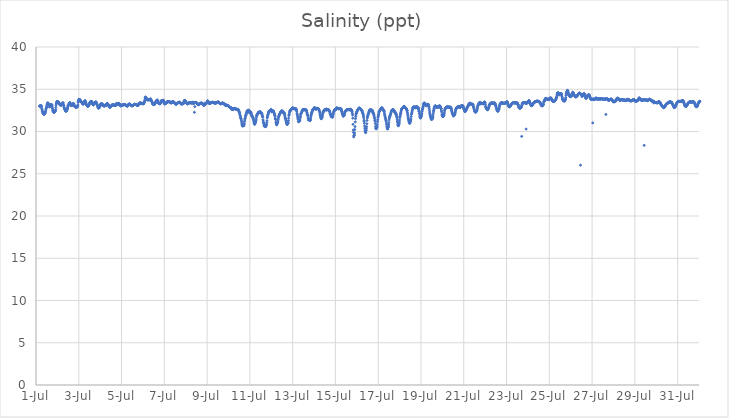
| Category | Salinity (ppt) |
|---|---|
| 44743.166666666664 | 32.98 |
| 44743.177083333336 | 33.02 |
| 44743.1875 | 33.01 |
| 44743.197916666664 | 33.05 |
| 44743.208333333336 | 33.06 |
| 44743.21875 | 33.03 |
| 44743.229166666664 | 33.04 |
| 44743.239583333336 | 33.05 |
| 44743.25 | 33.01 |
| 44743.260416666664 | 32.9 |
| 44743.270833333336 | 32.7 |
| 44743.28125 | 32.57 |
| 44743.291666666664 | 32.42 |
| 44743.302083333336 | 32.37 |
| 44743.3125 | 32.3 |
| 44743.322916666664 | 32.2 |
| 44743.333333333336 | 32.14 |
| 44743.34375 | 32.09 |
| 44743.354166666664 | 32.05 |
| 44743.364583333336 | 32.03 |
| 44743.375 | 32.03 |
| 44743.385416666664 | 32.08 |
| 44743.395833333336 | 32.12 |
| 44743.40625 | 32.13 |
| 44743.416666666664 | 32.15 |
| 44743.427083333336 | 32.22 |
| 44743.4375 | 32.3 |
| 44743.447916666664 | 32.38 |
| 44743.458333333336 | 32.54 |
| 44743.46875 | 32.67 |
| 44743.479166666664 | 32.76 |
| 44743.489583333336 | 32.83 |
| 44743.5 | 32.97 |
| 44743.510416666664 | 33.09 |
| 44743.520833333336 | 33.22 |
| 44743.53125 | 33.31 |
| 44743.541666666664 | 33.38 |
| 44743.552083333336 | 33.36 |
| 44743.5625 | 33.36 |
| 44743.572916666664 | 33.34 |
| 44743.583333333336 | 33.25 |
| 44743.59375 | 33.16 |
| 44743.604166666664 | 33.12 |
| 44743.614583333336 | 33.02 |
| 44743.625 | 32.96 |
| 44743.635416666664 | 32.93 |
| 44743.645833333336 | 32.91 |
| 44743.65625 | 33.01 |
| 44743.666666666664 | 33.02 |
| 44743.677083333336 | 33.11 |
| 44743.6875 | 33.08 |
| 44743.697916666664 | 33.15 |
| 44743.708333333336 | 33.2 |
| 44743.71875 | 33.18 |
| 44743.729166666664 | 33.14 |
| 44743.739583333336 | 33.16 |
| 44743.75 | 33.08 |
| 44743.760416666664 | 32.89 |
| 44743.770833333336 | 32.71 |
| 44743.78125 | 32.54 |
| 44743.791666666664 | 32.46 |
| 44743.802083333336 | 32.39 |
| 44743.8125 | 32.31 |
| 44743.822916666664 | 32.3 |
| 44743.833333333336 | 32.29 |
| 44743.84375 | 32.28 |
| 44743.854166666664 | 32.28 |
| 44743.864583333336 | 32.32 |
| 44743.875 | 32.35 |
| 44743.885416666664 | 32.37 |
| 44743.895833333336 | 32.38 |
| 44743.90625 | 32.45 |
| 44743.916666666664 | 32.59 |
| 44743.927083333336 | 32.84 |
| 44743.9375 | 33.12 |
| 44743.947916666664 | 33.27 |
| 44743.958333333336 | 33.34 |
| 44743.96875 | 33.45 |
| 44743.979166666664 | 33.54 |
| 44743.989583333336 | 33.55 |
| 44744.0 | 33.55 |
| 44744.010416666664 | 33.55 |
| 44744.020833333336 | 33.51 |
| 44744.03125 | 33.46 |
| 44744.041666666664 | 33.44 |
| 44744.052083333336 | 33.47 |
| 44744.0625 | 33.44 |
| 44744.072916666664 | 33.34 |
| 44744.083333333336 | 33.35 |
| 44744.09375 | 33.27 |
| 44744.104166666664 | 33.24 |
| 44744.114583333336 | 33.19 |
| 44744.125 | 33.19 |
| 44744.135416666664 | 33.12 |
| 44744.145833333336 | 33.11 |
| 44744.15625 | 33.19 |
| 44744.166666666664 | 33.16 |
| 44744.177083333336 | 33.1 |
| 44744.1875 | 33.14 |
| 44744.197916666664 | 33.18 |
| 44744.208333333336 | 33.28 |
| 44744.21875 | 33.27 |
| 44744.229166666664 | 33.32 |
| 44744.239583333336 | 33.33 |
| 44744.25 | 33.39 |
| 44744.260416666664 | 33.39 |
| 44744.270833333336 | 33.38 |
| 44744.28125 | 33.2 |
| 44744.291666666664 | 33.07 |
| 44744.302083333336 | 33.03 |
| 44744.3125 | 32.86 |
| 44744.322916666664 | 32.78 |
| 44744.333333333336 | 32.7 |
| 44744.34375 | 32.63 |
| 44744.354166666664 | 32.58 |
| 44744.364583333336 | 32.54 |
| 44744.375 | 32.47 |
| 44744.385416666664 | 32.44 |
| 44744.395833333336 | 32.41 |
| 44744.40625 | 32.4 |
| 44744.416666666664 | 32.41 |
| 44744.427083333336 | 32.49 |
| 44744.4375 | 32.52 |
| 44744.447916666664 | 32.54 |
| 44744.458333333336 | 32.61 |
| 44744.46875 | 32.7 |
| 44744.479166666664 | 32.84 |
| 44744.489583333336 | 32.95 |
| 44744.5 | 33.05 |
| 44744.510416666664 | 33.11 |
| 44744.520833333336 | 33.17 |
| 44744.53125 | 33.2 |
| 44744.541666666664 | 33.26 |
| 44744.552083333336 | 33.3 |
| 44744.5625 | 33.36 |
| 44744.572916666664 | 33.4 |
| 44744.583333333336 | 33.43 |
| 44744.59375 | 33.39 |
| 44744.604166666664 | 33.31 |
| 44744.614583333336 | 33.17 |
| 44744.625 | 33.14 |
| 44744.635416666664 | 33.12 |
| 44744.645833333336 | 33.1 |
| 44744.65625 | 33.06 |
| 44744.666666666664 | 33.12 |
| 44744.677083333336 | 33.12 |
| 44744.6875 | 33.11 |
| 44744.697916666664 | 33.12 |
| 44744.708333333336 | 33.19 |
| 44744.71875 | 33.2 |
| 44744.729166666664 | 33.26 |
| 44744.739583333336 | 33.32 |
| 44744.75 | 33.29 |
| 44744.760416666664 | 33.29 |
| 44744.770833333336 | 33.25 |
| 44744.78125 | 33.18 |
| 44744.791666666664 | 33.04 |
| 44744.802083333336 | 33.02 |
| 44744.8125 | 32.98 |
| 44744.822916666664 | 32.94 |
| 44744.833333333336 | 32.91 |
| 44744.84375 | 32.89 |
| 44744.854166666664 | 32.89 |
| 44744.864583333336 | 32.89 |
| 44744.875 | 32.88 |
| 44744.885416666664 | 32.89 |
| 44744.895833333336 | 32.89 |
| 44744.90625 | 32.89 |
| 44744.916666666664 | 32.89 |
| 44744.927083333336 | 32.93 |
| 44744.9375 | 32.95 |
| 44744.947916666664 | 32.99 |
| 44744.958333333336 | 33.14 |
| 44744.96875 | 33.45 |
| 44744.979166666664 | 33.55 |
| 44744.989583333336 | 33.65 |
| 44745.0 | 33.78 |
| 44745.010416666664 | 33.8 |
| 44745.020833333336 | 33.77 |
| 44745.03125 | 33.77 |
| 44745.041666666664 | 33.78 |
| 44745.052083333336 | 33.77 |
| 44745.0625 | 33.72 |
| 44745.072916666664 | 33.63 |
| 44745.083333333336 | 33.63 |
| 44745.09375 | 33.58 |
| 44745.104166666664 | 33.53 |
| 44745.114583333336 | 33.48 |
| 44745.125 | 33.46 |
| 44745.135416666664 | 33.43 |
| 44745.15625 | 33.43 |
| 44745.166666666664 | 33.36 |
| 44745.177083333336 | 33.32 |
| 44745.1875 | 33.24 |
| 44745.197916666664 | 33.25 |
| 44745.208333333336 | 33.24 |
| 44745.21875 | 33.29 |
| 44745.229166666664 | 33.33 |
| 44745.239583333336 | 33.4 |
| 44745.25 | 33.47 |
| 44745.260416666664 | 33.53 |
| 44745.270833333336 | 33.55 |
| 44745.28125 | 33.63 |
| 44745.291666666664 | 33.65 |
| 44745.302083333336 | 33.59 |
| 44745.3125 | 33.51 |
| 44745.322916666664 | 33.43 |
| 44745.333333333336 | 33.36 |
| 44745.34375 | 33.27 |
| 44745.354166666664 | 33.21 |
| 44745.364583333336 | 33.15 |
| 44745.375 | 33.1 |
| 44745.385416666664 | 33.09 |
| 44745.395833333336 | 33.03 |
| 44745.40625 | 33 |
| 44745.416666666664 | 32.97 |
| 44745.427083333336 | 32.97 |
| 44745.4375 | 33.03 |
| 44745.447916666664 | 33.06 |
| 44745.458333333336 | 33.06 |
| 44745.46875 | 33.09 |
| 44745.479166666664 | 33.13 |
| 44745.489583333336 | 33.19 |
| 44745.5 | 33.3 |
| 44745.510416666664 | 33.36 |
| 44745.520833333336 | 33.4 |
| 44745.53125 | 33.45 |
| 44745.541666666664 | 33.51 |
| 44745.552083333336 | 33.53 |
| 44745.5625 | 33.55 |
| 44745.572916666664 | 33.56 |
| 44745.583333333336 | 33.56 |
| 44745.59375 | 33.56 |
| 44745.604166666664 | 33.54 |
| 44745.614583333336 | 33.48 |
| 44745.625 | 33.42 |
| 44745.635416666664 | 33.35 |
| 44745.645833333336 | 33.28 |
| 44745.65625 | 33.21 |
| 44745.666666666664 | 33.19 |
| 44745.677083333336 | 33.16 |
| 44745.6875 | 33.15 |
| 44745.697916666664 | 33.2 |
| 44745.708333333336 | 33.24 |
| 44745.71875 | 33.39 |
| 44745.729166666664 | 33.38 |
| 44745.739583333336 | 33.37 |
| 44745.75 | 33.41 |
| 44745.760416666664 | 33.42 |
| 44745.770833333336 | 33.47 |
| 44745.78125 | 33.43 |
| 44745.791666666664 | 33.5 |
| 44745.802083333336 | 33.5 |
| 44745.8125 | 33.47 |
| 44745.822916666664 | 33.42 |
| 44745.833333333336 | 33.31 |
| 44745.84375 | 33.27 |
| 44745.854166666664 | 33.17 |
| 44745.864583333336 | 33.15 |
| 44745.875 | 33.08 |
| 44745.885416666664 | 32.94 |
| 44745.895833333336 | 32.85 |
| 44745.90625 | 32.78 |
| 44745.916666666664 | 32.79 |
| 44745.927083333336 | 32.77 |
| 44745.9375 | 32.78 |
| 44745.947916666664 | 32.8 |
| 44745.958333333336 | 32.86 |
| 44745.96875 | 32.88 |
| 44745.979166666664 | 32.9 |
| 44745.989583333336 | 32.97 |
| 44746.0 | 33.04 |
| 44746.010416666664 | 33.12 |
| 44746.020833333336 | 33.21 |
| 44746.03125 | 33.24 |
| 44746.041666666664 | 33.27 |
| 44746.052083333336 | 33.29 |
| 44746.0625 | 33.28 |
| 44746.072916666664 | 33.27 |
| 44746.083333333336 | 33.26 |
| 44746.09375 | 33.26 |
| 44746.104166666664 | 33.24 |
| 44746.114583333336 | 33.18 |
| 44746.125 | 33.15 |
| 44746.135416666664 | 33.1 |
| 44746.145833333336 | 33.08 |
| 44746.15625 | 33.06 |
| 44746.166666666664 | 33.04 |
| 44746.177083333336 | 33.03 |
| 44746.1875 | 33.01 |
| 44746.197916666664 | 33 |
| 44746.208333333336 | 33.1 |
| 44746.21875 | 33.04 |
| 44746.229166666664 | 33.05 |
| 44746.239583333336 | 33.11 |
| 44746.25 | 33.08 |
| 44746.260416666664 | 33.13 |
| 44746.270833333336 | 33.09 |
| 44746.28125 | 33.08 |
| 44746.291666666664 | 33.16 |
| 44746.302083333336 | 33.21 |
| 44746.3125 | 33.27 |
| 44746.322916666664 | 33.3 |
| 44746.333333333336 | 33.31 |
| 44746.34375 | 33.3 |
| 44746.354166666664 | 33.24 |
| 44746.364583333336 | 33.22 |
| 44746.375 | 33.16 |
| 44746.385416666664 | 33.12 |
| 44746.395833333336 | 33.07 |
| 44746.40625 | 33.02 |
| 44746.416666666664 | 32.96 |
| 44746.427083333336 | 32.92 |
| 44746.4375 | 32.87 |
| 44746.447916666664 | 32.87 |
| 44746.458333333336 | 32.87 |
| 44746.46875 | 32.9 |
| 44746.479166666664 | 32.93 |
| 44746.489583333336 | 32.94 |
| 44746.5 | 32.94 |
| 44746.510416666664 | 32.98 |
| 44746.520833333336 | 33.04 |
| 44746.53125 | 33.07 |
| 44746.541666666664 | 33.12 |
| 44746.552083333336 | 33.13 |
| 44746.5625 | 33.12 |
| 44746.572916666664 | 33.14 |
| 44746.583333333336 | 33.14 |
| 44746.59375 | 33.14 |
| 44746.604166666664 | 33.16 |
| 44746.614583333336 | 33.16 |
| 44746.625 | 33.16 |
| 44746.635416666664 | 33.15 |
| 44746.645833333336 | 33.13 |
| 44746.65625 | 33.13 |
| 44746.666666666664 | 33.1 |
| 44746.677083333336 | 33.1 |
| 44746.6875 | 33.09 |
| 44746.697916666664 | 33.05 |
| 44746.708333333336 | 33.1 |
| 44746.71875 | 33.12 |
| 44746.729166666664 | 33.15 |
| 44746.739583333336 | 33.18 |
| 44746.75 | 33.12 |
| 44746.760416666664 | 33.3 |
| 44746.770833333336 | 33.32 |
| 44746.78125 | 33.17 |
| 44746.791666666664 | 33.22 |
| 44746.802083333336 | 33.23 |
| 44746.8125 | 33.19 |
| 44746.822916666664 | 33.31 |
| 44746.833333333336 | 33.21 |
| 44746.84375 | 33.22 |
| 44746.854166666664 | 33.33 |
| 44746.864583333336 | 33.26 |
| 44746.875 | 33.27 |
| 44746.885416666664 | 33.28 |
| 44746.895833333336 | 33.29 |
| 44746.90625 | 33.23 |
| 44746.916666666664 | 33.22 |
| 44746.927083333336 | 33.16 |
| 44746.9375 | 33.09 |
| 44746.947916666664 | 33.04 |
| 44746.958333333336 | 33.05 |
| 44746.96875 | 33.03 |
| 44746.979166666664 | 33.08 |
| 44746.989583333336 | 33.07 |
| 44747.0 | 33.07 |
| 44747.010416666664 | 33.09 |
| 44747.020833333336 | 33.13 |
| 44747.03125 | 33.15 |
| 44747.041666666664 | 33.15 |
| 44747.052083333336 | 33.13 |
| 44747.0625 | 33.15 |
| 44747.072916666664 | 33.15 |
| 44747.083333333336 | 33.14 |
| 44747.09375 | 33.16 |
| 44747.104166666664 | 33.17 |
| 44747.114583333336 | 33.18 |
| 44747.125 | 33.2 |
| 44747.135416666664 | 33.21 |
| 44747.145833333336 | 33.2 |
| 44747.15625 | 33.18 |
| 44747.166666666664 | 33.15 |
| 44747.177083333336 | 33.16 |
| 44747.1875 | 33.14 |
| 44747.197916666664 | 33.09 |
| 44747.208333333336 | 33.1 |
| 44747.21875 | 33.08 |
| 44747.229166666664 | 33.07 |
| 44747.239583333336 | 33.02 |
| 44747.25 | 33.1 |
| 44747.260416666664 | 33.01 |
| 44747.270833333336 | 33.07 |
| 44747.28125 | 32.99 |
| 44747.291666666664 | 33.12 |
| 44747.302083333336 | 33.13 |
| 44747.3125 | 33.12 |
| 44747.322916666664 | 33.15 |
| 44747.333333333336 | 33.21 |
| 44747.34375 | 33.22 |
| 44747.354166666664 | 33.24 |
| 44747.364583333336 | 33.26 |
| 44747.375 | 33.26 |
| 44747.385416666664 | 33.25 |
| 44747.395833333336 | 33.22 |
| 44747.40625 | 33.19 |
| 44747.416666666664 | 33.16 |
| 44747.427083333336 | 33.13 |
| 44747.4375 | 33.11 |
| 44747.447916666664 | 33.09 |
| 44747.458333333336 | 33.07 |
| 44747.46875 | 33.05 |
| 44747.479166666664 | 33.04 |
| 44747.489583333336 | 33.04 |
| 44747.5 | 33.04 |
| 44747.510416666664 | 33.07 |
| 44747.520833333336 | 33.07 |
| 44747.53125 | 33.07 |
| 44747.541666666664 | 33.1 |
| 44747.552083333336 | 33.12 |
| 44747.5625 | 33.16 |
| 44747.572916666664 | 33.17 |
| 44747.583333333336 | 33.18 |
| 44747.59375 | 33.19 |
| 44747.604166666664 | 33.21 |
| 44747.614583333336 | 33.22 |
| 44747.625 | 33.22 |
| 44747.635416666664 | 33.21 |
| 44747.645833333336 | 33.2 |
| 44747.65625 | 33.2 |
| 44747.666666666664 | 33.2 |
| 44747.677083333336 | 33.18 |
| 44747.6875 | 33.17 |
| 44747.697916666664 | 33.16 |
| 44747.708333333336 | 33.15 |
| 44747.71875 | 33.12 |
| 44747.729166666664 | 33.1 |
| 44747.739583333336 | 33.09 |
| 44747.75 | 33.08 |
| 44747.760416666664 | 33.09 |
| 44747.770833333336 | 33.13 |
| 44747.78125 | 33.13 |
| 44747.791666666664 | 33.13 |
| 44747.802083333336 | 33.21 |
| 44747.8125 | 33.24 |
| 44747.822916666664 | 33.31 |
| 44747.833333333336 | 33.34 |
| 44747.84375 | 33.37 |
| 44747.854166666664 | 33.35 |
| 44747.864583333336 | 33.37 |
| 44747.875 | 33.34 |
| 44747.885416666664 | 33.39 |
| 44747.895833333336 | 33.38 |
| 44747.90625 | 33.36 |
| 44747.916666666664 | 33.34 |
| 44747.927083333336 | 33.32 |
| 44747.9375 | 33.32 |
| 44747.947916666664 | 33.29 |
| 44747.958333333336 | 33.3 |
| 44747.96875 | 33.3 |
| 44747.979166666664 | 33.3 |
| 44747.989583333336 | 33.29 |
| 44748.0 | 33.29 |
| 44748.010416666664 | 33.28 |
| 44748.020833333336 | 33.29 |
| 44748.03125 | 33.3 |
| 44748.041666666664 | 33.31 |
| 44748.052083333336 | 33.45 |
| 44748.0625 | 33.51 |
| 44748.072916666664 | 33.49 |
| 44748.083333333336 | 33.67 |
| 44748.09375 | 33.83 |
| 44748.104166666664 | 33.98 |
| 44748.114583333336 | 34.07 |
| 44748.125 | 34.06 |
| 44748.135416666664 | 34.05 |
| 44748.145833333336 | 34.02 |
| 44748.15625 | 33.94 |
| 44748.166666666664 | 33.9 |
| 44748.177083333336 | 33.81 |
| 44748.1875 | 33.75 |
| 44748.197916666664 | 33.74 |
| 44748.208333333336 | 33.76 |
| 44748.21875 | 33.76 |
| 44748.229166666664 | 33.76 |
| 44748.239583333336 | 33.78 |
| 44748.25 | 33.76 |
| 44748.260416666664 | 33.77 |
| 44748.270833333336 | 33.75 |
| 44748.28125 | 33.79 |
| 44748.291666666664 | 33.73 |
| 44748.302083333336 | 33.75 |
| 44748.3125 | 33.78 |
| 44748.322916666664 | 33.82 |
| 44748.333333333336 | 33.81 |
| 44748.34375 | 33.83 |
| 44748.354166666664 | 33.83 |
| 44748.364583333336 | 33.85 |
| 44748.375 | 33.8 |
| 44748.385416666664 | 33.7 |
| 44748.395833333336 | 33.66 |
| 44748.40625 | 33.6 |
| 44748.416666666664 | 33.53 |
| 44748.427083333336 | 33.47 |
| 44748.4375 | 33.37 |
| 44748.447916666664 | 33.32 |
| 44748.458333333336 | 33.28 |
| 44748.46875 | 33.24 |
| 44748.479166666664 | 33.22 |
| 44748.489583333336 | 33.21 |
| 44748.5 | 33.2 |
| 44748.510416666664 | 33.18 |
| 44748.520833333336 | 33.19 |
| 44748.53125 | 33.24 |
| 44748.541666666664 | 33.25 |
| 44748.552083333336 | 33.24 |
| 44748.5625 | 33.28 |
| 44748.572916666664 | 33.33 |
| 44748.583333333336 | 33.4 |
| 44748.59375 | 33.49 |
| 44748.604166666664 | 33.54 |
| 44748.614583333336 | 33.57 |
| 44748.625 | 33.62 |
| 44748.635416666664 | 33.65 |
| 44748.645833333336 | 33.67 |
| 44748.65625 | 33.71 |
| 44748.666666666664 | 33.73 |
| 44748.677083333336 | 33.69 |
| 44748.6875 | 33.63 |
| 44748.697916666664 | 33.56 |
| 44748.708333333336 | 33.47 |
| 44748.71875 | 33.41 |
| 44748.729166666664 | 33.36 |
| 44748.739583333336 | 33.35 |
| 44748.75 | 33.33 |
| 44748.760416666664 | 33.31 |
| 44748.770833333336 | 33.29 |
| 44748.78125 | 33.29 |
| 44748.791666666664 | 33.3 |
| 44748.802083333336 | 33.28 |
| 44748.8125 | 33.33 |
| 44748.822916666664 | 33.34 |
| 44748.833333333336 | 33.36 |
| 44748.84375 | 33.57 |
| 44748.854166666664 | 33.64 |
| 44748.864583333336 | 33.64 |
| 44748.875 | 33.66 |
| 44748.885416666664 | 33.58 |
| 44748.895833333336 | 33.63 |
| 44748.90625 | 33.63 |
| 44748.916666666664 | 33.64 |
| 44748.927083333336 | 33.68 |
| 44748.9375 | 33.68 |
| 44748.947916666664 | 33.68 |
| 44748.958333333336 | 33.7 |
| 44748.96875 | 33.55 |
| 44748.979166666664 | 33.5 |
| 44748.989583333336 | 33.43 |
| 44749.0 | 33.33 |
| 44749.010416666664 | 33.29 |
| 44749.020833333336 | 33.26 |
| 44749.03125 | 33.27 |
| 44749.041666666664 | 33.29 |
| 44749.052083333336 | 33.33 |
| 44749.0625 | 33.34 |
| 44749.072916666664 | 33.34 |
| 44749.083333333336 | 33.35 |
| 44749.09375 | 33.4 |
| 44749.104166666664 | 33.44 |
| 44749.114583333336 | 33.48 |
| 44749.125 | 33.49 |
| 44749.135416666664 | 33.49 |
| 44749.145833333336 | 33.52 |
| 44749.15625 | 33.53 |
| 44749.166666666664 | 33.54 |
| 44749.177083333336 | 33.53 |
| 44749.1875 | 33.54 |
| 44749.197916666664 | 33.53 |
| 44749.208333333336 | 33.53 |
| 44749.21875 | 33.53 |
| 44749.229166666664 | 33.51 |
| 44749.239583333336 | 33.51 |
| 44749.25 | 33.51 |
| 44749.260416666664 | 33.49 |
| 44749.270833333336 | 33.47 |
| 44749.28125 | 33.41 |
| 44749.291666666664 | 33.46 |
| 44749.302083333336 | 33.44 |
| 44749.3125 | 33.43 |
| 44749.322916666664 | 33.4 |
| 44749.333333333336 | 33.37 |
| 44749.34375 | 33.39 |
| 44749.354166666664 | 33.47 |
| 44749.364583333336 | 33.5 |
| 44749.375 | 33.53 |
| 44749.385416666664 | 33.5 |
| 44749.395833333336 | 33.52 |
| 44749.40625 | 33.53 |
| 44749.416666666664 | 33.52 |
| 44749.427083333336 | 33.52 |
| 44749.4375 | 33.5 |
| 44749.447916666664 | 33.49 |
| 44749.458333333336 | 33.44 |
| 44749.46875 | 33.41 |
| 44749.479166666664 | 33.36 |
| 44749.489583333336 | 33.35 |
| 44749.5 | 33.34 |
| 44749.510416666664 | 33.3 |
| 44749.520833333336 | 33.27 |
| 44749.53125 | 33.25 |
| 44749.541666666664 | 33.24 |
| 44749.552083333336 | 33.22 |
| 44749.5625 | 33.25 |
| 44749.572916666664 | 33.27 |
| 44749.583333333336 | 33.27 |
| 44749.59375 | 33.3 |
| 44749.604166666664 | 33.32 |
| 44749.614583333336 | 33.35 |
| 44749.625 | 33.39 |
| 44749.635416666664 | 33.41 |
| 44749.645833333336 | 33.42 |
| 44749.65625 | 33.43 |
| 44749.666666666664 | 33.43 |
| 44749.677083333336 | 33.44 |
| 44749.6875 | 33.45 |
| 44749.697916666664 | 33.46 |
| 44749.708333333336 | 33.46 |
| 44749.71875 | 33.46 |
| 44749.729166666664 | 33.44 |
| 44749.739583333336 | 33.42 |
| 44749.75 | 33.37 |
| 44749.760416666664 | 33.35 |
| 44749.770833333336 | 33.32 |
| 44749.78125 | 33.27 |
| 44749.791666666664 | 33.25 |
| 44749.802083333336 | 33.24 |
| 44749.8125 | 33.32 |
| 44749.822916666664 | 33.32 |
| 44749.833333333336 | 33.29 |
| 44749.84375 | 33.3 |
| 44749.854166666664 | 33.32 |
| 44749.864583333336 | 33.26 |
| 44749.875 | 33.28 |
| 44749.885416666664 | 33.39 |
| 44749.895833333336 | 33.31 |
| 44749.90625 | 33.45 |
| 44749.916666666664 | 33.44 |
| 44749.927083333336 | 33.65 |
| 44749.9375 | 33.52 |
| 44749.947916666664 | 33.66 |
| 44749.958333333336 | 33.67 |
| 44749.96875 | 33.64 |
| 44749.979166666664 | 33.65 |
| 44749.989583333336 | 33.6 |
| 44750.0 | 33.55 |
| 44750.010416666664 | 33.49 |
| 44750.020833333336 | 33.45 |
| 44750.03125 | 33.39 |
| 44750.041666666664 | 33.35 |
| 44750.052083333336 | 33.32 |
| 44750.0625 | 33.3 |
| 44750.072916666664 | 33.27 |
| 44750.083333333336 | 33.27 |
| 44750.09375 | 33.27 |
| 44750.104166666664 | 33.33 |
| 44750.114583333336 | 33.32 |
| 44750.125 | 33.32 |
| 44750.135416666664 | 33.35 |
| 44750.145833333336 | 33.39 |
| 44750.15625 | 33.42 |
| 44750.166666666664 | 33.41 |
| 44750.177083333336 | 33.41 |
| 44750.1875 | 33.39 |
| 44750.197916666664 | 33.4 |
| 44750.208333333336 | 33.41 |
| 44750.21875 | 33.4 |
| 44750.229166666664 | 33.41 |
| 44750.239583333336 | 33.41 |
| 44750.25 | 33.4 |
| 44750.260416666664 | 33.4 |
| 44750.270833333336 | 33.38 |
| 44750.28125 | 33.38 |
| 44750.291666666664 | 33.37 |
| 44750.302083333336 | 33.38 |
| 44750.3125 | 33.37 |
| 44750.322916666664 | 33.4 |
| 44750.333333333336 | 33.48 |
| 44750.34375 | 33.4 |
| 44750.354166666664 | 33.33 |
| 44750.364583333336 | 33.31 |
| 44750.375 | 33.35 |
| 44750.385416666664 | 33.38 |
| 44750.395833333336 | 33.36 |
| 44750.40625 | 32.27 |
| 44750.416666666664 | 33.43 |
| 44750.427083333336 | 32.95 |
| 44750.4375 | 33.43 |
| 44750.447916666664 | 33.43 |
| 44750.458333333336 | 33.45 |
| 44750.46875 | 33.44 |
| 44750.479166666664 | 33.44 |
| 44750.489583333336 | 33.44 |
| 44750.5 | 33.41 |
| 44750.510416666664 | 33.38 |
| 44750.520833333336 | 33.36 |
| 44750.53125 | 33.33 |
| 44750.541666666664 | 33.3 |
| 44750.552083333336 | 33.26 |
| 44750.5625 | 33.25 |
| 44750.572916666664 | 33.21 |
| 44750.583333333336 | 33.18 |
| 44750.59375 | 33.17 |
| 44750.604166666664 | 33.22 |
| 44750.614583333336 | 33.22 |
| 44750.625 | 33.21 |
| 44750.635416666664 | 33.24 |
| 44750.645833333336 | 33.28 |
| 44750.65625 | 33.3 |
| 44750.666666666664 | 33.31 |
| 44750.677083333336 | 33.33 |
| 44750.6875 | 33.33 |
| 44750.697916666664 | 33.34 |
| 44750.708333333336 | 33.34 |
| 44750.71875 | 33.36 |
| 44750.729166666664 | 33.36 |
| 44750.739583333336 | 33.36 |
| 44750.75 | 33.36 |
| 44750.760416666664 | 33.35 |
| 44750.770833333336 | 33.31 |
| 44750.78125 | 33.3 |
| 44750.791666666664 | 33.2 |
| 44750.802083333336 | 33.25 |
| 44750.8125 | 33.23 |
| 44750.822916666664 | 33.19 |
| 44750.833333333336 | 33.09 |
| 44750.84375 | 33.13 |
| 44750.854166666664 | 33.16 |
| 44750.864583333336 | 33.12 |
| 44750.875 | 33.13 |
| 44750.885416666664 | 33.34 |
| 44750.895833333336 | 33.2 |
| 44750.90625 | 33.22 |
| 44750.916666666664 | 33.23 |
| 44750.927083333336 | 33.25 |
| 44750.9375 | 33.32 |
| 44750.947916666664 | 33.32 |
| 44750.958333333336 | 33.3 |
| 44750.96875 | 33.33 |
| 44750.979166666664 | 33.35 |
| 44750.989583333336 | 33.44 |
| 44751.0 | 33.49 |
| 44751.010416666664 | 33.48 |
| 44751.020833333336 | 33.61 |
| 44751.03125 | 33.63 |
| 44751.041666666664 | 33.57 |
| 44751.052083333336 | 33.51 |
| 44751.0625 | 33.49 |
| 44751.072916666664 | 33.43 |
| 44751.083333333336 | 33.38 |
| 44751.09375 | 33.34 |
| 44751.104166666664 | 33.33 |
| 44751.114583333336 | 33.32 |
| 44751.125 | 33.32 |
| 44751.135416666664 | 33.34 |
| 44751.145833333336 | 33.34 |
| 44751.15625 | 33.35 |
| 44751.166666666664 | 33.39 |
| 44751.177083333336 | 33.39 |
| 44751.1875 | 33.43 |
| 44751.197916666664 | 33.41 |
| 44751.208333333336 | 33.42 |
| 44751.21875 | 33.43 |
| 44751.229166666664 | 33.44 |
| 44751.239583333336 | 33.46 |
| 44751.25 | 33.45 |
| 44751.260416666664 | 33.45 |
| 44751.270833333336 | 33.45 |
| 44751.28125 | 33.44 |
| 44751.291666666664 | 33.42 |
| 44751.302083333336 | 33.42 |
| 44751.3125 | 33.42 |
| 44751.322916666664 | 33.39 |
| 44751.333333333336 | 33.39 |
| 44751.34375 | 33.39 |
| 44751.354166666664 | 33.36 |
| 44751.364583333336 | 33.35 |
| 44751.375 | 33.35 |
| 44751.385416666664 | 33.38 |
| 44751.395833333336 | 33.38 |
| 44751.40625 | 33.39 |
| 44751.416666666664 | 33.39 |
| 44751.427083333336 | 33.41 |
| 44751.4375 | 33.39 |
| 44751.447916666664 | 33.41 |
| 44751.458333333336 | 33.42 |
| 44751.46875 | 33.44 |
| 44751.479166666664 | 33.47 |
| 44751.489583333336 | 33.49 |
| 44751.5 | 33.49 |
| 44751.510416666664 | 33.48 |
| 44751.520833333336 | 33.48 |
| 44751.53125 | 33.47 |
| 44751.541666666664 | 33.46 |
| 44751.552083333336 | 33.41 |
| 44751.5625 | 33.4 |
| 44751.572916666664 | 33.37 |
| 44751.583333333336 | 33.35 |
| 44751.59375 | 33.33 |
| 44751.604166666664 | 33.31 |
| 44751.614583333336 | 33.3 |
| 44751.625 | 33.28 |
| 44751.635416666664 | 33.28 |
| 44751.645833333336 | 33.3 |
| 44751.65625 | 33.29 |
| 44751.666666666664 | 33.3 |
| 44751.677083333336 | 33.31 |
| 44751.6875 | 33.33 |
| 44751.697916666664 | 33.36 |
| 44751.708333333336 | 33.38 |
| 44751.71875 | 33.37 |
| 44751.729166666664 | 33.36 |
| 44751.739583333336 | 33.36 |
| 44751.75 | 33.34 |
| 44751.760416666664 | 33.33 |
| 44751.770833333336 | 33.31 |
| 44751.78125 | 33.28 |
| 44751.791666666664 | 33.26 |
| 44751.802083333336 | 33.25 |
| 44751.8125 | 33.24 |
| 44751.822916666664 | 33.22 |
| 44751.833333333336 | 33.17 |
| 44751.84375 | 33.14 |
| 44751.854166666664 | 33.11 |
| 44751.864583333336 | 33.09 |
| 44751.875 | 33.06 |
| 44751.885416666664 | 33.09 |
| 44751.895833333336 | 33.08 |
| 44751.90625 | 33.15 |
| 44751.916666666664 | 33.12 |
| 44751.927083333336 | 33.1 |
| 44751.9375 | 33.09 |
| 44751.947916666664 | 33.09 |
| 44751.958333333336 | 33.07 |
| 44751.96875 | 33.04 |
| 44751.979166666664 | 33.06 |
| 44751.989583333336 | 33.04 |
| 44752.0 | 33.04 |
| 44752.010416666664 | 33 |
| 44752.020833333336 | 32.98 |
| 44752.03125 | 32.97 |
| 44752.041666666664 | 32.93 |
| 44752.052083333336 | 32.87 |
| 44752.0625 | 32.85 |
| 44752.072916666664 | 32.83 |
| 44752.083333333336 | 32.81 |
| 44752.09375 | 32.79 |
| 44752.104166666664 | 32.83 |
| 44752.114583333336 | 32.79 |
| 44752.125 | 32.8 |
| 44752.135416666664 | 32.77 |
| 44752.145833333336 | 32.69 |
| 44752.15625 | 32.61 |
| 44752.166666666664 | 32.6 |
| 44752.177083333336 | 32.62 |
| 44752.1875 | 32.66 |
| 44752.197916666664 | 32.71 |
| 44752.208333333336 | 32.68 |
| 44752.21875 | 32.65 |
| 44752.229166666664 | 32.64 |
| 44752.239583333336 | 32.65 |
| 44752.25 | 32.67 |
| 44752.260416666664 | 32.69 |
| 44752.270833333336 | 32.71 |
| 44752.28125 | 32.73 |
| 44752.291666666664 | 32.73 |
| 44752.302083333336 | 32.72 |
| 44752.3125 | 32.71 |
| 44752.322916666664 | 32.7 |
| 44752.333333333336 | 32.69 |
| 44752.34375 | 32.67 |
| 44752.354166666664 | 32.65 |
| 44752.364583333336 | 32.62 |
| 44752.375 | 32.61 |
| 44752.385416666664 | 32.61 |
| 44752.395833333336 | 32.61 |
| 44752.40625 | 32.62 |
| 44752.416666666664 | 32.62 |
| 44752.427083333336 | 32.6 |
| 44752.4375 | 32.61 |
| 44752.447916666664 | 32.61 |
| 44752.458333333336 | 32.5 |
| 44752.46875 | 32.53 |
| 44752.479166666664 | 32.45 |
| 44752.489583333336 | 32.41 |
| 44752.5 | 32.3 |
| 44752.510416666664 | 32.22 |
| 44752.520833333336 | 32.23 |
| 44752.53125 | 32.05 |
| 44752.541666666664 | 31.93 |
| 44752.552083333336 | 31.82 |
| 44752.5625 | 31.72 |
| 44752.572916666664 | 31.56 |
| 44752.583333333336 | 31.5 |
| 44752.59375 | 31.49 |
| 44752.604166666664 | 31.3 |
| 44752.614583333336 | 31.14 |
| 44752.625 | 30.98 |
| 44752.635416666664 | 30.82 |
| 44752.645833333336 | 30.69 |
| 44752.65625 | 30.66 |
| 44752.666666666664 | 30.68 |
| 44752.677083333336 | 30.69 |
| 44752.6875 | 30.73 |
| 44752.697916666664 | 30.71 |
| 44752.708333333336 | 30.67 |
| 44752.71875 | 30.7 |
| 44752.729166666664 | 30.84 |
| 44752.739583333336 | 30.97 |
| 44752.75 | 31.19 |
| 44752.760416666664 | 31.37 |
| 44752.770833333336 | 31.5 |
| 44752.78125 | 31.6 |
| 44752.791666666664 | 31.74 |
| 44752.802083333336 | 31.86 |
| 44752.8125 | 31.94 |
| 44752.822916666664 | 31.99 |
| 44752.833333333336 | 32.09 |
| 44752.84375 | 32.2 |
| 44752.854166666664 | 32.3 |
| 44752.864583333336 | 32.37 |
| 44752.875 | 32.43 |
| 44752.885416666664 | 32.46 |
| 44752.895833333336 | 32.49 |
| 44752.90625 | 32.49 |
| 44752.916666666664 | 32.5 |
| 44752.927083333336 | 32.51 |
| 44752.9375 | 32.52 |
| 44752.947916666664 | 32.47 |
| 44752.958333333336 | 32.38 |
| 44752.96875 | 32.47 |
| 44752.979166666664 | 32.21 |
| 44752.989583333336 | 32.28 |
| 44753.0 | 32.38 |
| 44753.010416666664 | 32.28 |
| 44753.020833333336 | 32.33 |
| 44753.03125 | 32.34 |
| 44753.041666666664 | 32.26 |
| 44753.052083333336 | 32.25 |
| 44753.0625 | 32.08 |
| 44753.072916666664 | 32.02 |
| 44753.083333333336 | 31.92 |
| 44753.09375 | 31.84 |
| 44753.104166666664 | 31.81 |
| 44753.114583333336 | 31.77 |
| 44753.125 | 31.77 |
| 44753.135416666664 | 31.66 |
| 44753.145833333336 | 31.61 |
| 44753.15625 | 31.51 |
| 44753.166666666664 | 31.43 |
| 44753.177083333336 | 31.28 |
| 44753.1875 | 31.14 |
| 44753.197916666664 | 31.01 |
| 44753.208333333336 | 30.92 |
| 44753.21875 | 30.86 |
| 44753.229166666664 | 30.85 |
| 44753.239583333336 | 30.96 |
| 44753.25 | 31.04 |
| 44753.260416666664 | 31.07 |
| 44753.270833333336 | 31.15 |
| 44753.28125 | 31.29 |
| 44753.291666666664 | 31.39 |
| 44753.302083333336 | 31.62 |
| 44753.3125 | 31.82 |
| 44753.322916666664 | 31.91 |
| 44753.333333333336 | 31.96 |
| 44753.34375 | 32.02 |
| 44753.354166666664 | 32.04 |
| 44753.364583333336 | 32.06 |
| 44753.375 | 32.1 |
| 44753.385416666664 | 32.2 |
| 44753.395833333336 | 32.23 |
| 44753.40625 | 32.25 |
| 44753.416666666664 | 32.27 |
| 44753.427083333336 | 32.31 |
| 44753.4375 | 32.33 |
| 44753.447916666664 | 32.34 |
| 44753.458333333336 | 32.27 |
| 44753.46875 | 32.27 |
| 44753.479166666664 | 32.28 |
| 44753.489583333336 | 32.34 |
| 44753.5 | 32.27 |
| 44753.510416666664 | 32.25 |
| 44753.520833333336 | 32.23 |
| 44753.53125 | 32.19 |
| 44753.541666666664 | 32.18 |
| 44753.552083333336 | 32.11 |
| 44753.5625 | 32.09 |
| 44753.572916666664 | 31.99 |
| 44753.583333333336 | 31.85 |
| 44753.59375 | 31.77 |
| 44753.604166666664 | 31.7 |
| 44753.614583333336 | 31.39 |
| 44753.625 | 31.22 |
| 44753.635416666664 | 31.07 |
| 44753.645833333336 | 30.94 |
| 44753.65625 | 30.91 |
| 44753.666666666664 | 30.72 |
| 44753.677083333336 | 30.67 |
| 44753.6875 | 30.62 |
| 44753.697916666664 | 30.57 |
| 44753.708333333336 | 30.66 |
| 44753.71875 | 30.63 |
| 44753.729166666664 | 30.65 |
| 44753.739583333336 | 30.67 |
| 44753.75 | 30.59 |
| 44753.760416666664 | 30.68 |
| 44753.770833333336 | 30.77 |
| 44753.78125 | 30.87 |
| 44753.791666666664 | 31.06 |
| 44753.802083333336 | 31.28 |
| 44753.8125 | 31.62 |
| 44753.822916666664 | 31.74 |
| 44753.833333333336 | 31.9 |
| 44753.84375 | 32.03 |
| 44753.854166666664 | 32.06 |
| 44753.864583333336 | 32.17 |
| 44753.875 | 32.26 |
| 44753.885416666664 | 32.36 |
| 44753.895833333336 | 32.4 |
| 44753.90625 | 32.41 |
| 44753.916666666664 | 32.43 |
| 44753.927083333336 | 32.44 |
| 44753.9375 | 32.46 |
| 44753.947916666664 | 32.49 |
| 44753.958333333336 | 32.53 |
| 44753.96875 | 32.55 |
| 44753.979166666664 | 32.57 |
| 44753.989583333336 | 32.59 |
| 44754.0 | 32.59 |
| 44754.010416666664 | 32.53 |
| 44754.020833333336 | 32.32 |
| 44754.03125 | 32.49 |
| 44754.041666666664 | 32.37 |
| 44754.052083333336 | 32.37 |
| 44754.0625 | 32.43 |
| 44754.072916666664 | 32.44 |
| 44754.083333333336 | 32.44 |
| 44754.09375 | 32.4 |
| 44754.104166666664 | 32.4 |
| 44754.114583333336 | 32.3 |
| 44754.125 | 32.23 |
| 44754.135416666664 | 32.17 |
| 44754.145833333336 | 32.08 |
| 44754.15625 | 32 |
| 44754.166666666664 | 31.9 |
| 44754.177083333336 | 31.77 |
| 44754.1875 | 31.55 |
| 44754.197916666664 | 31.45 |
| 44754.208333333336 | 31.41 |
| 44754.21875 | 31.12 |
| 44754.229166666664 | 30.99 |
| 44754.239583333336 | 30.86 |
| 44754.25 | 30.8 |
| 44754.260416666664 | 30.8 |
| 44754.270833333336 | 30.98 |
| 44754.28125 | 30.98 |
| 44754.291666666664 | 31.01 |
| 44754.302083333336 | 31.12 |
| 44754.3125 | 31.23 |
| 44754.322916666664 | 31.4 |
| 44754.333333333336 | 31.6 |
| 44754.34375 | 31.74 |
| 44754.354166666664 | 31.82 |
| 44754.364583333336 | 31.91 |
| 44754.375 | 31.98 |
| 44754.385416666664 | 32.03 |
| 44754.395833333336 | 32.07 |
| 44754.40625 | 32.12 |
| 44754.416666666664 | 32.17 |
| 44754.427083333336 | 32.24 |
| 44754.4375 | 32.3 |
| 44754.447916666664 | 32.34 |
| 44754.458333333336 | 32.37 |
| 44754.46875 | 32.4 |
| 44754.479166666664 | 32.42 |
| 44754.489583333336 | 32.44 |
| 44754.5 | 32.45 |
| 44754.510416666664 | 32.39 |
| 44754.520833333336 | 32.39 |
| 44754.53125 | 32.35 |
| 44754.541666666664 | 32.28 |
| 44754.552083333336 | 32.23 |
| 44754.5625 | 32.33 |
| 44754.572916666664 | 32.18 |
| 44754.583333333336 | 32.14 |
| 44754.59375 | 32.2 |
| 44754.604166666664 | 32.21 |
| 44754.614583333336 | 32.12 |
| 44754.625 | 32.01 |
| 44754.635416666664 | 31.84 |
| 44754.645833333336 | 31.7 |
| 44754.65625 | 31.58 |
| 44754.666666666664 | 31.52 |
| 44754.677083333336 | 31.48 |
| 44754.6875 | 31.32 |
| 44754.697916666664 | 31.2 |
| 44754.708333333336 | 31.08 |
| 44754.71875 | 30.98 |
| 44754.729166666664 | 30.9 |
| 44754.739583333336 | 30.85 |
| 44754.75 | 30.83 |
| 44754.760416666664 | 30.94 |
| 44754.770833333336 | 30.95 |
| 44754.78125 | 30.97 |
| 44754.791666666664 | 31.09 |
| 44754.802083333336 | 31.3 |
| 44754.8125 | 31.57 |
| 44754.822916666664 | 31.87 |
| 44754.833333333336 | 31.98 |
| 44754.84375 | 32.07 |
| 44754.854166666664 | 32.26 |
| 44754.864583333336 | 32.38 |
| 44754.875 | 32.44 |
| 44754.885416666664 | 32.44 |
| 44754.895833333336 | 32.48 |
| 44754.90625 | 32.52 |
| 44754.916666666664 | 32.59 |
| 44754.927083333336 | 32.6 |
| 44754.9375 | 32.62 |
| 44754.947916666664 | 32.67 |
| 44754.958333333336 | 32.67 |
| 44754.96875 | 32.71 |
| 44754.979166666664 | 32.76 |
| 44754.989583333336 | 32.79 |
| 44755.0 | 32.79 |
| 44755.010416666664 | 32.79 |
| 44755.020833333336 | 32.77 |
| 44755.03125 | 32.74 |
| 44755.041666666664 | 32.73 |
| 44755.052083333336 | 32.71 |
| 44755.0625 | 32.68 |
| 44755.072916666664 | 32.68 |
| 44755.083333333336 | 32.69 |
| 44755.09375 | 32.72 |
| 44755.104166666664 | 32.7 |
| 44755.114583333336 | 32.68 |
| 44755.125 | 32.72 |
| 44755.135416666664 | 32.71 |
| 44755.145833333336 | 32.71 |
| 44755.15625 | 32.67 |
| 44755.166666666664 | 32.61 |
| 44755.177083333336 | 32.55 |
| 44755.1875 | 32.44 |
| 44755.197916666664 | 32.32 |
| 44755.208333333336 | 32.11 |
| 44755.21875 | 31.99 |
| 44755.229166666664 | 31.84 |
| 44755.239583333336 | 31.65 |
| 44755.25 | 31.5 |
| 44755.260416666664 | 31.4 |
| 44755.270833333336 | 31.18 |
| 44755.28125 | 31.15 |
| 44755.291666666664 | 31.17 |
| 44755.302083333336 | 31.25 |
| 44755.3125 | 31.25 |
| 44755.322916666664 | 31.25 |
| 44755.333333333336 | 31.33 |
| 44755.34375 | 31.49 |
| 44755.354166666664 | 31.65 |
| 44755.364583333336 | 31.8 |
| 44755.375 | 31.98 |
| 44755.385416666664 | 32.09 |
| 44755.395833333336 | 32.15 |
| 44755.40625 | 32.2 |
| 44755.416666666664 | 32.24 |
| 44755.427083333336 | 32.31 |
| 44755.4375 | 32.38 |
| 44755.447916666664 | 32.44 |
| 44755.458333333336 | 32.47 |
| 44755.46875 | 32.54 |
| 44755.479166666664 | 32.58 |
| 44755.489583333336 | 32.59 |
| 44755.5 | 32.6 |
| 44755.510416666664 | 32.6 |
| 44755.520833333336 | 32.6 |
| 44755.53125 | 32.6 |
| 44755.541666666664 | 32.6 |
| 44755.552083333336 | 32.58 |
| 44755.5625 | 32.58 |
| 44755.572916666664 | 32.57 |
| 44755.583333333336 | 32.59 |
| 44755.59375 | 32.56 |
| 44755.604166666664 | 32.55 |
| 44755.614583333336 | 32.56 |
| 44755.625 | 32.54 |
| 44755.635416666664 | 32.53 |
| 44755.645833333336 | 32.5 |
| 44755.65625 | 32.41 |
| 44755.666666666664 | 32.23 |
| 44755.677083333336 | 32.16 |
| 44755.6875 | 32.02 |
| 44755.697916666664 | 31.94 |
| 44755.708333333336 | 31.89 |
| 44755.71875 | 31.72 |
| 44755.729166666664 | 31.52 |
| 44755.739583333336 | 31.35 |
| 44755.75 | 31.45 |
| 44755.760416666664 | 31.39 |
| 44755.770833333336 | 31.45 |
| 44755.78125 | 31.37 |
| 44755.791666666664 | 31.39 |
| 44755.802083333336 | 31.41 |
| 44755.8125 | 31.31 |
| 44755.822916666664 | 31.31 |
| 44755.833333333336 | 31.42 |
| 44755.84375 | 31.61 |
| 44755.854166666664 | 31.83 |
| 44755.864583333336 | 31.93 |
| 44755.875 | 32.06 |
| 44755.885416666664 | 32.17 |
| 44755.895833333336 | 32.25 |
| 44755.90625 | 32.32 |
| 44755.916666666664 | 32.41 |
| 44755.927083333336 | 32.52 |
| 44755.9375 | 32.59 |
| 44755.947916666664 | 32.62 |
| 44755.958333333336 | 32.62 |
| 44755.96875 | 32.61 |
| 44755.979166666664 | 32.61 |
| 44755.989583333336 | 32.65 |
| 44756.0 | 32.73 |
| 44756.010416666664 | 32.81 |
| 44756.020833333336 | 32.84 |
| 44756.03125 | 32.81 |
| 44756.041666666664 | 32.76 |
| 44756.052083333336 | 32.75 |
| 44756.0625 | 32.71 |
| 44756.072916666664 | 32.68 |
| 44756.083333333336 | 32.64 |
| 44756.09375 | 32.71 |
| 44756.104166666664 | 32.65 |
| 44756.114583333336 | 32.7 |
| 44756.125 | 32.75 |
| 44756.135416666664 | 32.74 |
| 44756.145833333336 | 32.74 |
| 44756.15625 | 32.72 |
| 44756.166666666664 | 32.72 |
| 44756.177083333336 | 32.72 |
| 44756.1875 | 32.71 |
| 44756.197916666664 | 32.68 |
| 44756.208333333336 | 32.65 |
| 44756.21875 | 32.65 |
| 44756.229166666664 | 32.6 |
| 44756.239583333336 | 32.51 |
| 44756.25 | 32.4 |
| 44756.260416666664 | 32.35 |
| 44756.270833333336 | 32.2 |
| 44756.28125 | 32.04 |
| 44756.291666666664 | 31.89 |
| 44756.302083333336 | 31.83 |
| 44756.3125 | 31.64 |
| 44756.322916666664 | 31.61 |
| 44756.333333333336 | 31.5 |
| 44756.34375 | 31.53 |
| 44756.354166666664 | 31.63 |
| 44756.364583333336 | 31.59 |
| 44756.375 | 31.66 |
| 44756.385416666664 | 31.76 |
| 44756.395833333336 | 31.95 |
| 44756.40625 | 32.11 |
| 44756.416666666664 | 32.23 |
| 44756.427083333336 | 32.3 |
| 44756.4375 | 32.34 |
| 44756.447916666664 | 32.38 |
| 44756.458333333336 | 32.44 |
| 44756.46875 | 32.48 |
| 44756.479166666664 | 32.51 |
| 44756.489583333336 | 32.57 |
| 44756.5 | 32.59 |
| 44756.510416666664 | 32.6 |
| 44756.520833333336 | 32.6 |
| 44756.53125 | 32.59 |
| 44756.541666666664 | 32.6 |
| 44756.552083333336 | 32.6 |
| 44756.5625 | 32.63 |
| 44756.572916666664 | 32.65 |
| 44756.583333333336 | 32.5 |
| 44756.59375 | 32.61 |
| 44756.604166666664 | 32.63 |
| 44756.614583333336 | 32.62 |
| 44756.625 | 32.6 |
| 44756.635416666664 | 32.6 |
| 44756.645833333336 | 32.62 |
| 44756.65625 | 32.56 |
| 44756.666666666664 | 32.59 |
| 44756.677083333336 | 32.58 |
| 44756.6875 | 32.56 |
| 44756.697916666664 | 32.53 |
| 44756.708333333336 | 32.46 |
| 44756.71875 | 32.42 |
| 44756.729166666664 | 32.39 |
| 44756.739583333336 | 32.3 |
| 44756.75 | 32.14 |
| 44756.760416666664 | 32.17 |
| 44756.770833333336 | 32.05 |
| 44756.78125 | 31.96 |
| 44756.791666666664 | 31.91 |
| 44756.802083333336 | 31.74 |
| 44756.8125 | 31.8 |
| 44756.822916666664 | 31.77 |
| 44756.833333333336 | 31.76 |
| 44756.84375 | 31.82 |
| 44756.854166666664 | 31.76 |
| 44756.864583333336 | 31.69 |
| 44756.875 | 31.73 |
| 44756.885416666664 | 31.84 |
| 44756.895833333336 | 32.03 |
| 44756.90625 | 32.16 |
| 44756.916666666664 | 32.3 |
| 44756.927083333336 | 32.38 |
| 44756.9375 | 32.42 |
| 44756.947916666664 | 32.47 |
| 44756.958333333336 | 32.55 |
| 44756.96875 | 32.59 |
| 44756.979166666664 | 32.63 |
| 44756.989583333336 | 32.63 |
| 44757.0 | 32.6 |
| 44757.010416666664 | 32.59 |
| 44757.020833333336 | 32.59 |
| 44757.03125 | 32.65 |
| 44757.041666666664 | 32.72 |
| 44757.052083333336 | 32.78 |
| 44757.0625 | 32.79 |
| 44757.072916666664 | 32.78 |
| 44757.083333333336 | 32.77 |
| 44757.09375 | 32.74 |
| 44757.104166666664 | 32.73 |
| 44757.114583333336 | 32.72 |
| 44757.125 | 32.73 |
| 44757.135416666664 | 32.69 |
| 44757.145833333336 | 32.69 |
| 44757.15625 | 32.72 |
| 44757.166666666664 | 32.73 |
| 44757.177083333336 | 32.72 |
| 44757.1875 | 32.71 |
| 44757.197916666664 | 32.71 |
| 44757.208333333336 | 32.71 |
| 44757.21875 | 32.7 |
| 44757.229166666664 | 32.69 |
| 44757.239583333336 | 32.69 |
| 44757.25 | 32.68 |
| 44757.260416666664 | 32.66 |
| 44757.270833333336 | 32.64 |
| 44757.28125 | 32.54 |
| 44757.291666666664 | 32.42 |
| 44757.302083333336 | 32.36 |
| 44757.3125 | 32.22 |
| 44757.322916666664 | 32.09 |
| 44757.333333333336 | 32.04 |
| 44757.34375 | 32.03 |
| 44757.354166666664 | 31.87 |
| 44757.364583333336 | 31.81 |
| 44757.375 | 31.82 |
| 44757.385416666664 | 31.9 |
| 44757.395833333336 | 31.91 |
| 44757.40625 | 31.92 |
| 44757.416666666664 | 32 |
| 44757.427083333336 | 32.1 |
| 44757.4375 | 32.21 |
| 44757.447916666664 | 32.32 |
| 44757.458333333336 | 32.39 |
| 44757.46875 | 32.42 |
| 44757.479166666664 | 32.43 |
| 44757.489583333336 | 32.44 |
| 44757.5 | 32.48 |
| 44757.510416666664 | 32.51 |
| 44757.520833333336 | 32.53 |
| 44757.53125 | 32.57 |
| 44757.541666666664 | 32.57 |
| 44757.552083333336 | 32.58 |
| 44757.5625 | 32.59 |
| 44757.572916666664 | 32.59 |
| 44757.583333333336 | 32.6 |
| 44757.59375 | 32.58 |
| 44757.604166666664 | 32.61 |
| 44757.614583333336 | 32.6 |
| 44757.625 | 32.57 |
| 44757.635416666664 | 32.59 |
| 44757.645833333336 | 32.59 |
| 44757.65625 | 32.58 |
| 44757.666666666664 | 32.58 |
| 44757.677083333336 | 32.59 |
| 44757.6875 | 32.65 |
| 44757.697916666664 | 32.57 |
| 44757.708333333336 | 32.56 |
| 44757.71875 | 32.57 |
| 44757.729166666664 | 32.57 |
| 44757.739583333336 | 32.58 |
| 44757.75 | 32.5 |
| 44757.760416666664 | 32.46 |
| 44757.770833333336 | 32.43 |
| 44757.78125 | 32.32 |
| 44757.791666666664 | 32.14 |
| 44757.802083333336 | 31.95 |
| 44757.8125 | 31.58 |
| 44757.822916666664 | 30.85 |
| 44757.833333333336 | 30.18 |
| 44757.84375 | 29.88 |
| 44757.854166666664 | 29.36 |
| 44757.864583333336 | 29.5 |
| 44757.875 | 29.53 |
| 44757.885416666664 | 29.58 |
| 44757.895833333336 | 29.83 |
| 44757.90625 | 30.23 |
| 44757.916666666664 | 30.58 |
| 44757.927083333336 | 31.13 |
| 44757.9375 | 31.52 |
| 44757.947916666664 | 31.77 |
| 44757.958333333336 | 31.96 |
| 44757.96875 | 32.1 |
| 44757.979166666664 | 32.17 |
| 44757.989583333336 | 32.24 |
| 44758.0 | 32.31 |
| 44758.010416666664 | 32.36 |
| 44758.020833333336 | 32.45 |
| 44758.03125 | 32.5 |
| 44758.041666666664 | 32.55 |
| 44758.052083333336 | 32.56 |
| 44758.0625 | 32.6 |
| 44758.072916666664 | 32.64 |
| 44758.083333333336 | 32.69 |
| 44758.09375 | 32.74 |
| 44758.104166666664 | 32.79 |
| 44758.114583333336 | 32.78 |
| 44758.125 | 32.75 |
| 44758.135416666664 | 32.73 |
| 44758.145833333336 | 32.72 |
| 44758.15625 | 32.68 |
| 44758.166666666664 | 32.68 |
| 44758.177083333336 | 32.66 |
| 44758.1875 | 32.66 |
| 44758.197916666664 | 32.62 |
| 44758.208333333336 | 32.57 |
| 44758.21875 | 32.52 |
| 44758.229166666664 | 32.47 |
| 44758.239583333336 | 32.48 |
| 44758.25 | 32.41 |
| 44758.260416666664 | 32.3 |
| 44758.270833333336 | 32.23 |
| 44758.28125 | 32.16 |
| 44758.291666666664 | 32.08 |
| 44758.302083333336 | 31.96 |
| 44758.3125 | 31.81 |
| 44758.322916666664 | 31.61 |
| 44758.333333333336 | 31.34 |
| 44758.34375 | 31.2 |
| 44758.354166666664 | 30.97 |
| 44758.364583333336 | 30.65 |
| 44758.375 | 30.4 |
| 44758.385416666664 | 30.18 |
| 44758.395833333336 | 29.97 |
| 44758.40625 | 29.87 |
| 44758.416666666664 | 29.88 |
| 44758.427083333336 | 30.12 |
| 44758.4375 | 30.15 |
| 44758.447916666664 | 30.35 |
| 44758.458333333336 | 30.57 |
| 44758.46875 | 30.92 |
| 44758.479166666664 | 31.31 |
| 44758.489583333336 | 31.59 |
| 44758.5 | 31.74 |
| 44758.510416666664 | 31.85 |
| 44758.520833333336 | 31.94 |
| 44758.53125 | 32.03 |
| 44758.541666666664 | 32.09 |
| 44758.552083333336 | 32.18 |
| 44758.5625 | 32.29 |
| 44758.572916666664 | 32.38 |
| 44758.583333333336 | 32.45 |
| 44758.59375 | 32.48 |
| 44758.604166666664 | 32.52 |
| 44758.614583333336 | 32.54 |
| 44758.625 | 32.57 |
| 44758.635416666664 | 32.56 |
| 44758.645833333336 | 32.6 |
| 44758.65625 | 32.45 |
| 44758.666666666664 | 32.41 |
| 44758.677083333336 | 32.43 |
| 44758.6875 | 32.56 |
| 44758.697916666664 | 32.54 |
| 44758.708333333336 | 32.42 |
| 44758.71875 | 32.42 |
| 44758.729166666664 | 32.38 |
| 44758.739583333336 | 32.47 |
| 44758.75 | 32.32 |
| 44758.760416666664 | 32.2 |
| 44758.770833333336 | 32.12 |
| 44758.78125 | 32.16 |
| 44758.791666666664 | 32.03 |
| 44758.802083333336 | 31.94 |
| 44758.8125 | 31.8 |
| 44758.822916666664 | 31.62 |
| 44758.833333333336 | 31.53 |
| 44758.84375 | 31.32 |
| 44758.854166666664 | 31.23 |
| 44758.864583333336 | 30.94 |
| 44758.875 | 30.6 |
| 44758.885416666664 | 30.41 |
| 44758.895833333336 | 30.35 |
| 44758.90625 | 30.31 |
| 44758.916666666664 | 30.36 |
| 44758.927083333336 | 30.48 |
| 44758.9375 | 30.49 |
| 44758.947916666664 | 30.62 |
| 44758.958333333336 | 30.82 |
| 44758.96875 | 31.14 |
| 44758.979166666664 | 31.39 |
| 44758.989583333336 | 31.65 |
| 44759.0 | 31.81 |
| 44759.010416666664 | 31.93 |
| 44759.020833333336 | 32.06 |
| 44759.03125 | 32.2 |
| 44759.041666666664 | 32.33 |
| 44759.052083333336 | 32.41 |
| 44759.0625 | 32.39 |
| 44759.072916666664 | 32.45 |
| 44759.083333333336 | 32.51 |
| 44759.09375 | 32.55 |
| 44759.104166666664 | 32.57 |
| 44759.114583333336 | 32.62 |
| 44759.125 | 32.7 |
| 44759.135416666664 | 32.73 |
| 44759.145833333336 | 32.77 |
| 44759.15625 | 32.79 |
| 44759.166666666664 | 32.79 |
| 44759.177083333336 | 32.8 |
| 44759.1875 | 32.76 |
| 44759.197916666664 | 32.7 |
| 44759.208333333336 | 32.69 |
| 44759.21875 | 32.64 |
| 44759.229166666664 | 32.59 |
| 44759.239583333336 | 32.55 |
| 44759.25 | 32.5 |
| 44759.260416666664 | 32.48 |
| 44759.270833333336 | 32.41 |
| 44759.28125 | 32.34 |
| 44759.291666666664 | 32.17 |
| 44759.302083333336 | 31.98 |
| 44759.3125 | 31.86 |
| 44759.322916666664 | 31.72 |
| 44759.333333333336 | 31.66 |
| 44759.34375 | 31.53 |
| 44759.354166666664 | 31.4 |
| 44759.364583333336 | 31.28 |
| 44759.375 | 31.22 |
| 44759.385416666664 | 30.99 |
| 44759.395833333336 | 30.81 |
| 44759.40625 | 30.62 |
| 44759.416666666664 | 30.46 |
| 44759.427083333336 | 30.37 |
| 44759.4375 | 30.32 |
| 44759.447916666664 | 30.3 |
| 44759.458333333336 | 30.52 |
| 44759.46875 | 30.49 |
| 44759.479166666664 | 30.6 |
| 44759.489583333336 | 30.78 |
| 44759.5 | 31.05 |
| 44759.510416666664 | 31.37 |
| 44759.520833333336 | 31.57 |
| 44759.53125 | 31.68 |
| 44759.541666666664 | 31.78 |
| 44759.552083333336 | 31.86 |
| 44759.5625 | 31.92 |
| 44759.572916666664 | 32.01 |
| 44759.583333333336 | 32.1 |
| 44759.59375 | 32.19 |
| 44759.604166666664 | 32.3 |
| 44759.614583333336 | 32.41 |
| 44759.625 | 32.47 |
| 44759.635416666664 | 32.5 |
| 44759.645833333336 | 32.51 |
| 44759.65625 | 32.54 |
| 44759.666666666664 | 32.55 |
| 44759.677083333336 | 32.58 |
| 44759.6875 | 32.59 |
| 44759.697916666664 | 32.61 |
| 44759.708333333336 | 32.43 |
| 44759.71875 | 32.38 |
| 44759.729166666664 | 32.45 |
| 44759.739583333336 | 32.45 |
| 44759.75 | 32.44 |
| 44759.760416666664 | 32.37 |
| 44759.770833333336 | 32.35 |
| 44759.78125 | 32.26 |
| 44759.791666666664 | 32.24 |
| 44759.802083333336 | 32.26 |
| 44759.8125 | 32.11 |
| 44759.822916666664 | 32.12 |
| 44759.833333333336 | 32.09 |
| 44759.84375 | 32 |
| 44759.854166666664 | 31.91 |
| 44759.864583333336 | 31.78 |
| 44759.875 | 31.67 |
| 44759.885416666664 | 31.47 |
| 44759.895833333336 | 31.24 |
| 44759.90625 | 31.1 |
| 44759.916666666664 | 30.86 |
| 44759.927083333336 | 30.75 |
| 44759.9375 | 30.68 |
| 44759.947916666664 | 30.69 |
| 44759.958333333336 | 30.85 |
| 44759.96875 | 30.87 |
| 44759.979166666664 | 30.94 |
| 44759.989583333336 | 31.12 |
| 44760.0 | 31.36 |
| 44760.010416666664 | 31.64 |
| 44760.020833333336 | 31.77 |
| 44760.03125 | 31.93 |
| 44760.041666666664 | 32.07 |
| 44760.052083333336 | 32.18 |
| 44760.0625 | 32.3 |
| 44760.072916666664 | 32.43 |
| 44760.083333333336 | 32.55 |
| 44760.09375 | 32.62 |
| 44760.104166666664 | 32.69 |
| 44760.114583333336 | 32.72 |
| 44760.125 | 32.76 |
| 44760.135416666664 | 32.78 |
| 44760.145833333336 | 32.79 |
| 44760.15625 | 32.82 |
| 44760.166666666664 | 32.86 |
| 44760.177083333336 | 32.9 |
| 44760.1875 | 32.93 |
| 44760.197916666664 | 32.97 |
| 44760.208333333336 | 32.97 |
| 44760.21875 | 32.98 |
| 44760.229166666664 | 32.85 |
| 44760.239583333336 | 32.9 |
| 44760.25 | 32.86 |
| 44760.260416666664 | 32.82 |
| 44760.270833333336 | 32.83 |
| 44760.28125 | 32.77 |
| 44760.291666666664 | 32.76 |
| 44760.302083333336 | 32.73 |
| 44760.3125 | 32.73 |
| 44760.322916666664 | 32.63 |
| 44760.333333333336 | 32.63 |
| 44760.34375 | 32.48 |
| 44760.354166666664 | 32.46 |
| 44760.364583333336 | 32.27 |
| 44760.375 | 32.09 |
| 44760.385416666664 | 31.92 |
| 44760.395833333336 | 31.71 |
| 44760.40625 | 31.57 |
| 44760.416666666664 | 31.43 |
| 44760.427083333336 | 31.32 |
| 44760.4375 | 31.18 |
| 44760.447916666664 | 31.1 |
| 44760.458333333336 | 31.01 |
| 44760.46875 | 30.97 |
| 44760.479166666664 | 30.98 |
| 44760.489583333336 | 31.15 |
| 44760.5 | 31.13 |
| 44760.510416666664 | 31.25 |
| 44760.520833333336 | 31.37 |
| 44760.53125 | 31.48 |
| 44760.541666666664 | 31.77 |
| 44760.552083333336 | 32.02 |
| 44760.5625 | 32.1 |
| 44760.572916666664 | 32.19 |
| 44760.583333333336 | 32.32 |
| 44760.59375 | 32.47 |
| 44760.604166666664 | 32.61 |
| 44760.614583333336 | 32.74 |
| 44760.625 | 32.83 |
| 44760.635416666664 | 32.86 |
| 44760.645833333336 | 32.9 |
| 44760.65625 | 32.9 |
| 44760.666666666664 | 32.9 |
| 44760.677083333336 | 32.88 |
| 44760.6875 | 32.87 |
| 44760.697916666664 | 32.86 |
| 44760.708333333336 | 32.87 |
| 44760.71875 | 32.88 |
| 44760.729166666664 | 32.9 |
| 44760.739583333336 | 32.9 |
| 44760.75 | 32.84 |
| 44760.760416666664 | 32.79 |
| 44760.770833333336 | 32.85 |
| 44760.78125 | 32.93 |
| 44760.791666666664 | 32.91 |
| 44760.802083333336 | 32.95 |
| 44760.8125 | 32.93 |
| 44760.822916666664 | 32.9 |
| 44760.833333333336 | 32.83 |
| 44760.84375 | 32.81 |
| 44760.854166666664 | 32.82 |
| 44760.864583333336 | 32.8 |
| 44760.875 | 32.79 |
| 44760.885416666664 | 32.66 |
| 44760.895833333336 | 32.56 |
| 44760.90625 | 32.41 |
| 44760.916666666664 | 32.39 |
| 44760.927083333336 | 32.18 |
| 44760.9375 | 31.99 |
| 44760.947916666664 | 31.79 |
| 44760.958333333336 | 31.68 |
| 44760.96875 | 31.62 |
| 44760.979166666664 | 31.6 |
| 44760.989583333336 | 31.63 |
| 44761.0 | 31.73 |
| 44761.010416666664 | 31.79 |
| 44761.020833333336 | 31.86 |
| 44761.03125 | 32.03 |
| 44761.041666666664 | 32.18 |
| 44761.052083333336 | 32.38 |
| 44761.0625 | 32.55 |
| 44761.072916666664 | 32.65 |
| 44761.083333333336 | 32.76 |
| 44761.09375 | 32.86 |
| 44761.104166666664 | 32.99 |
| 44761.114583333336 | 33.14 |
| 44761.125 | 33.26 |
| 44761.135416666664 | 33.35 |
| 44761.145833333336 | 33.36 |
| 44761.15625 | 33.35 |
| 44761.166666666664 | 33.34 |
| 44761.177083333336 | 33.32 |
| 44761.1875 | 33.27 |
| 44761.197916666664 | 33.2 |
| 44761.208333333336 | 33.14 |
| 44761.21875 | 33.13 |
| 44761.229166666664 | 33.1 |
| 44761.239583333336 | 33.07 |
| 44761.25 | 33.05 |
| 44761.260416666664 | 33.14 |
| 44761.270833333336 | 33.11 |
| 44761.28125 | 33.09 |
| 44761.291666666664 | 33.14 |
| 44761.302083333336 | 33.14 |
| 44761.3125 | 33.21 |
| 44761.322916666664 | 33.22 |
| 44761.333333333336 | 33.21 |
| 44761.34375 | 33.21 |
| 44761.354166666664 | 33.17 |
| 44761.364583333336 | 32.96 |
| 44761.375 | 32.91 |
| 44761.385416666664 | 32.73 |
| 44761.395833333336 | 32.51 |
| 44761.40625 | 32.3 |
| 44761.416666666664 | 32.1 |
| 44761.427083333336 | 32 |
| 44761.4375 | 31.88 |
| 44761.447916666664 | 31.8 |
| 44761.458333333336 | 31.66 |
| 44761.46875 | 31.56 |
| 44761.479166666664 | 31.47 |
| 44761.489583333336 | 31.43 |
| 44761.5 | 31.44 |
| 44761.510416666664 | 31.44 |
| 44761.520833333336 | 31.52 |
| 44761.53125 | 31.56 |
| 44761.541666666664 | 31.57 |
| 44761.552083333336 | 31.69 |
| 44761.5625 | 31.83 |
| 44761.572916666664 | 32.09 |
| 44761.583333333336 | 32.32 |
| 44761.59375 | 32.47 |
| 44761.604166666664 | 32.61 |
| 44761.614583333336 | 32.73 |
| 44761.625 | 32.83 |
| 44761.635416666664 | 32.87 |
| 44761.645833333336 | 32.95 |
| 44761.65625 | 33.01 |
| 44761.666666666664 | 33.04 |
| 44761.677083333336 | 33.04 |
| 44761.6875 | 32.99 |
| 44761.697916666664 | 32.96 |
| 44761.708333333336 | 32.92 |
| 44761.71875 | 32.9 |
| 44761.729166666664 | 32.88 |
| 44761.739583333336 | 32.88 |
| 44761.75 | 32.88 |
| 44761.760416666664 | 32.91 |
| 44761.770833333336 | 32.87 |
| 44761.78125 | 32.89 |
| 44761.791666666664 | 32.89 |
| 44761.802083333336 | 32.89 |
| 44761.8125 | 32.88 |
| 44761.822916666664 | 32.98 |
| 44761.833333333336 | 32.95 |
| 44761.84375 | 32.98 |
| 44761.854166666664 | 33 |
| 44761.864583333336 | 33.04 |
| 44761.875 | 33.03 |
| 44761.885416666664 | 33.02 |
| 44761.895833333336 | 32.98 |
| 44761.90625 | 32.94 |
| 44761.916666666664 | 32.83 |
| 44761.927083333336 | 32.75 |
| 44761.9375 | 32.69 |
| 44761.947916666664 | 32.69 |
| 44761.958333333336 | 32.45 |
| 44761.96875 | 32.32 |
| 44761.979166666664 | 32.06 |
| 44761.989583333336 | 31.94 |
| 44762.0 | 31.89 |
| 44762.010416666664 | 31.79 |
| 44762.020833333336 | 31.75 |
| 44762.03125 | 31.75 |
| 44762.041666666664 | 31.81 |
| 44762.052083333336 | 31.9 |
| 44762.0625 | 31.89 |
| 44762.072916666664 | 31.93 |
| 44762.083333333336 | 32.08 |
| 44762.09375 | 32.21 |
| 44762.104166666664 | 32.44 |
| 44762.114583333336 | 32.56 |
| 44762.125 | 32.67 |
| 44762.135416666664 | 32.72 |
| 44762.145833333336 | 32.75 |
| 44762.15625 | 32.78 |
| 44762.166666666664 | 32.8 |
| 44762.177083333336 | 32.82 |
| 44762.1875 | 32.84 |
| 44762.197916666664 | 32.87 |
| 44762.208333333336 | 32.9 |
| 44762.21875 | 32.91 |
| 44762.229166666664 | 32.92 |
| 44762.239583333336 | 32.92 |
| 44762.25 | 32.91 |
| 44762.260416666664 | 32.9 |
| 44762.270833333336 | 32.89 |
| 44762.28125 | 32.88 |
| 44762.291666666664 | 32.88 |
| 44762.302083333336 | 32.87 |
| 44762.3125 | 32.87 |
| 44762.322916666664 | 32.88 |
| 44762.333333333336 | 32.88 |
| 44762.34375 | 32.89 |
| 44762.354166666664 | 32.87 |
| 44762.364583333336 | 32.88 |
| 44762.375 | 32.87 |
| 44762.385416666664 | 32.85 |
| 44762.395833333336 | 32.82 |
| 44762.40625 | 32.73 |
| 44762.416666666664 | 32.72 |
| 44762.427083333336 | 32.55 |
| 44762.4375 | 32.44 |
| 44762.447916666664 | 32.34 |
| 44762.458333333336 | 32.24 |
| 44762.46875 | 32.16 |
| 44762.479166666664 | 32.11 |
| 44762.489583333336 | 32.05 |
| 44762.5 | 31.97 |
| 44762.510416666664 | 31.89 |
| 44762.520833333336 | 31.87 |
| 44762.53125 | 31.84 |
| 44762.541666666664 | 31.89 |
| 44762.552083333336 | 31.95 |
| 44762.5625 | 31.97 |
| 44762.572916666664 | 32 |
| 44762.583333333336 | 32.08 |
| 44762.59375 | 32.16 |
| 44762.604166666664 | 32.3 |
| 44762.614583333336 | 32.45 |
| 44762.625 | 32.59 |
| 44762.635416666664 | 32.65 |
| 44762.645833333336 | 32.72 |
| 44762.65625 | 32.78 |
| 44762.666666666664 | 32.81 |
| 44762.677083333336 | 32.84 |
| 44762.6875 | 32.86 |
| 44762.697916666664 | 32.88 |
| 44762.708333333336 | 32.9 |
| 44762.71875 | 32.92 |
| 44762.729166666664 | 32.91 |
| 44762.739583333336 | 32.91 |
| 44762.75 | 32.91 |
| 44762.760416666664 | 32.9 |
| 44762.770833333336 | 32.91 |
| 44762.78125 | 32.92 |
| 44762.791666666664 | 32.93 |
| 44762.802083333336 | 32.94 |
| 44762.8125 | 32.96 |
| 44762.822916666664 | 32.85 |
| 44762.833333333336 | 32.85 |
| 44762.84375 | 32.87 |
| 44762.854166666664 | 32.95 |
| 44762.864583333336 | 32.98 |
| 44762.875 | 33.05 |
| 44762.885416666664 | 33.04 |
| 44762.895833333336 | 33.03 |
| 44762.90625 | 33.05 |
| 44762.916666666664 | 33.02 |
| 44762.927083333336 | 33.04 |
| 44762.9375 | 33.04 |
| 44762.947916666664 | 33.05 |
| 44762.958333333336 | 33.04 |
| 44762.96875 | 32.97 |
| 44762.979166666664 | 32.89 |
| 44762.989583333336 | 32.8 |
| 44763.0 | 32.71 |
| 44763.010416666664 | 32.65 |
| 44763.020833333336 | 32.6 |
| 44763.03125 | 32.51 |
| 44763.041666666664 | 32.45 |
| 44763.052083333336 | 32.36 |
| 44763.0625 | 32.35 |
| 44763.072916666664 | 32.38 |
| 44763.083333333336 | 32.49 |
| 44763.09375 | 32.5 |
| 44763.104166666664 | 32.51 |
| 44763.114583333336 | 32.58 |
| 44763.125 | 32.64 |
| 44763.135416666664 | 32.69 |
| 44763.145833333336 | 32.75 |
| 44763.15625 | 32.83 |
| 44763.166666666664 | 32.89 |
| 44763.177083333336 | 32.92 |
| 44763.1875 | 32.96 |
| 44763.197916666664 | 33 |
| 44763.208333333336 | 33.04 |
| 44763.21875 | 33.11 |
| 44763.229166666664 | 33.18 |
| 44763.239583333336 | 33.23 |
| 44763.25 | 33.26 |
| 44763.260416666664 | 33.29 |
| 44763.270833333336 | 33.32 |
| 44763.28125 | 33.34 |
| 44763.291666666664 | 33.33 |
| 44763.302083333336 | 33.34 |
| 44763.3125 | 33.33 |
| 44763.322916666664 | 33.3 |
| 44763.333333333336 | 33.25 |
| 44763.34375 | 33.21 |
| 44763.354166666664 | 33.22 |
| 44763.364583333336 | 33.21 |
| 44763.375 | 33.21 |
| 44763.385416666664 | 33.23 |
| 44763.395833333336 | 33.22 |
| 44763.40625 | 33.23 |
| 44763.416666666664 | 33.19 |
| 44763.427083333336 | 33.19 |
| 44763.4375 | 33.16 |
| 44763.447916666664 | 33 |
| 44763.458333333336 | 32.9 |
| 44763.46875 | 32.82 |
| 44763.479166666664 | 32.71 |
| 44763.489583333336 | 32.57 |
| 44763.5 | 32.48 |
| 44763.510416666664 | 32.39 |
| 44763.520833333336 | 32.35 |
| 44763.53125 | 32.32 |
| 44763.541666666664 | 32.3 |
| 44763.552083333336 | 32.28 |
| 44763.5625 | 32.28 |
| 44763.572916666664 | 32.34 |
| 44763.583333333336 | 32.39 |
| 44763.59375 | 32.39 |
| 44763.604166666664 | 32.42 |
| 44763.614583333336 | 32.5 |
| 44763.625 | 32.61 |
| 44763.635416666664 | 32.77 |
| 44763.645833333336 | 32.91 |
| 44763.65625 | 33.03 |
| 44763.666666666664 | 33.09 |
| 44763.677083333336 | 33.13 |
| 44763.6875 | 33.2 |
| 44763.697916666664 | 33.27 |
| 44763.708333333336 | 33.31 |
| 44763.71875 | 33.35 |
| 44763.729166666664 | 33.41 |
| 44763.739583333336 | 33.42 |
| 44763.75 | 33.42 |
| 44763.760416666664 | 33.4 |
| 44763.770833333336 | 33.37 |
| 44763.78125 | 33.26 |
| 44763.791666666664 | 33.34 |
| 44763.802083333336 | 33.33 |
| 44763.8125 | 33.34 |
| 44763.822916666664 | 33.33 |
| 44763.833333333336 | 33.34 |
| 44763.84375 | 33.36 |
| 44763.854166666664 | 33.32 |
| 44763.864583333336 | 33.3 |
| 44763.875 | 33.28 |
| 44763.885416666664 | 33.31 |
| 44763.895833333336 | 33.34 |
| 44763.90625 | 33.33 |
| 44763.916666666664 | 33.26 |
| 44763.927083333336 | 33.39 |
| 44763.9375 | 33.36 |
| 44763.947916666664 | 33.39 |
| 44763.958333333336 | 33.41 |
| 44763.96875 | 33.5 |
| 44763.979166666664 | 33.47 |
| 44763.989583333336 | 33.47 |
| 44764.0 | 33.39 |
| 44764.010416666664 | 33.22 |
| 44764.020833333336 | 32.99 |
| 44764.03125 | 32.89 |
| 44764.041666666664 | 32.83 |
| 44764.052083333336 | 32.75 |
| 44764.0625 | 32.74 |
| 44764.072916666664 | 32.7 |
| 44764.083333333336 | 32.66 |
| 44764.09375 | 32.63 |
| 44764.104166666664 | 32.6 |
| 44764.114583333336 | 32.56 |
| 44764.125 | 32.62 |
| 44764.135416666664 | 32.67 |
| 44764.145833333336 | 32.69 |
| 44764.15625 | 32.75 |
| 44764.166666666664 | 32.83 |
| 44764.177083333336 | 32.94 |
| 44764.1875 | 33.05 |
| 44764.197916666664 | 33.13 |
| 44764.208333333336 | 33.18 |
| 44764.21875 | 33.22 |
| 44764.229166666664 | 33.24 |
| 44764.239583333336 | 33.28 |
| 44764.25 | 33.31 |
| 44764.260416666664 | 33.33 |
| 44764.270833333336 | 33.34 |
| 44764.28125 | 33.36 |
| 44764.291666666664 | 33.39 |
| 44764.302083333336 | 33.39 |
| 44764.3125 | 33.39 |
| 44764.322916666664 | 33.39 |
| 44764.333333333336 | 33.39 |
| 44764.34375 | 33.38 |
| 44764.354166666664 | 33.34 |
| 44764.364583333336 | 33.3 |
| 44764.375 | 33.32 |
| 44764.385416666664 | 33.33 |
| 44764.395833333336 | 33.35 |
| 44764.40625 | 33.38 |
| 44764.416666666664 | 33.35 |
| 44764.427083333336 | 33.36 |
| 44764.4375 | 33.36 |
| 44764.447916666664 | 33.37 |
| 44764.458333333336 | 33.35 |
| 44764.46875 | 33.3 |
| 44764.479166666664 | 33.2 |
| 44764.489583333336 | 33.08 |
| 44764.5 | 33.03 |
| 44764.510416666664 | 33.01 |
| 44764.520833333336 | 32.85 |
| 44764.53125 | 32.72 |
| 44764.541666666664 | 32.63 |
| 44764.552083333336 | 32.55 |
| 44764.5625 | 32.51 |
| 44764.572916666664 | 32.45 |
| 44764.583333333336 | 32.39 |
| 44764.59375 | 32.41 |
| 44764.604166666664 | 32.42 |
| 44764.614583333336 | 32.48 |
| 44764.625 | 32.51 |
| 44764.635416666664 | 32.56 |
| 44764.645833333336 | 32.66 |
| 44764.65625 | 32.76 |
| 44764.666666666664 | 32.91 |
| 44764.677083333336 | 33.05 |
| 44764.6875 | 33.16 |
| 44764.697916666664 | 33.25 |
| 44764.708333333336 | 33.26 |
| 44764.71875 | 33.3 |
| 44764.729166666664 | 33.34 |
| 44764.739583333336 | 33.38 |
| 44764.75 | 33.38 |
| 44764.760416666664 | 33.39 |
| 44764.770833333336 | 33.39 |
| 44764.78125 | 33.39 |
| 44764.791666666664 | 33.4 |
| 44764.802083333336 | 33.39 |
| 44764.8125 | 33.37 |
| 44764.822916666664 | 33.36 |
| 44764.833333333336 | 33.34 |
| 44764.84375 | 33.33 |
| 44764.854166666664 | 33.34 |
| 44764.864583333336 | 33.35 |
| 44764.875 | 33.35 |
| 44764.885416666664 | 33.35 |
| 44764.895833333336 | 33.35 |
| 44764.90625 | 33.33 |
| 44764.916666666664 | 33.33 |
| 44764.927083333336 | 33.35 |
| 44764.9375 | 33.38 |
| 44764.947916666664 | 33.39 |
| 44764.958333333336 | 33.41 |
| 44764.96875 | 33.42 |
| 44764.979166666664 | 33.38 |
| 44764.989583333336 | 33.41 |
| 44765.0 | 33.44 |
| 44765.010416666664 | 33.5 |
| 44765.020833333336 | 33.52 |
| 44765.03125 | 33.52 |
| 44765.041666666664 | 33.47 |
| 44765.052083333336 | 33.33 |
| 44765.0625 | 33.26 |
| 44765.072916666664 | 33.17 |
| 44765.083333333336 | 33.05 |
| 44765.09375 | 33.01 |
| 44765.104166666664 | 32.97 |
| 44765.114583333336 | 32.95 |
| 44765.125 | 32.91 |
| 44765.135416666664 | 32.92 |
| 44765.145833333336 | 32.97 |
| 44765.15625 | 33.01 |
| 44765.166666666664 | 33 |
| 44765.177083333336 | 33.01 |
| 44765.1875 | 33.03 |
| 44765.197916666664 | 33.08 |
| 44765.208333333336 | 33.13 |
| 44765.21875 | 33.2 |
| 44765.229166666664 | 33.27 |
| 44765.239583333336 | 33.28 |
| 44765.25 | 33.3 |
| 44765.260416666664 | 33.32 |
| 44765.270833333336 | 33.34 |
| 44765.28125 | 33.35 |
| 44765.291666666664 | 33.37 |
| 44765.302083333336 | 33.38 |
| 44765.3125 | 33.4 |
| 44765.322916666664 | 33.4 |
| 44765.333333333336 | 33.41 |
| 44765.34375 | 33.41 |
| 44765.354166666664 | 33.41 |
| 44765.364583333336 | 33.41 |
| 44765.375 | 33.4 |
| 44765.385416666664 | 33.4 |
| 44765.395833333336 | 33.37 |
| 44765.40625 | 33.38 |
| 44765.416666666664 | 33.36 |
| 44765.427083333336 | 33.38 |
| 44765.4375 | 33.41 |
| 44765.447916666664 | 33.38 |
| 44765.458333333336 | 33.37 |
| 44765.46875 | 33.39 |
| 44765.479166666664 | 33.4 |
| 44765.489583333336 | 33.39 |
| 44765.5 | 33.39 |
| 44765.510416666664 | 33.32 |
| 44765.520833333336 | 33.26 |
| 44765.53125 | 33.18 |
| 44765.541666666664 | 33.14 |
| 44765.552083333336 | 33.17 |
| 44765.5625 | 32.96 |
| 44765.572916666664 | 32.89 |
| 44765.583333333336 | 32.9 |
| 44765.59375 | 32.86 |
| 44765.604166666664 | 32.77 |
| 44765.614583333336 | 32.74 |
| 44765.625 | 32.76 |
| 44765.635416666664 | 32.75 |
| 44765.645833333336 | 32.8 |
| 44765.65625 | 32.77 |
| 44765.666666666664 | 32.83 |
| 44765.677083333336 | 32.83 |
| 44765.6875 | 32.87 |
| 44765.697916666664 | 32.99 |
| 44765.708333333336 | 29.42 |
| 44765.71875 | 33.09 |
| 44765.729166666664 | 33.22 |
| 44765.739583333336 | 33.31 |
| 44765.75 | 33.33 |
| 44765.760416666664 | 33.35 |
| 44765.770833333336 | 33.39 |
| 44765.78125 | 33.41 |
| 44765.791666666664 | 33.41 |
| 44765.802083333336 | 33.42 |
| 44765.8125 | 33.41 |
| 44765.822916666664 | 33.42 |
| 44765.833333333336 | 33.42 |
| 44765.84375 | 33.41 |
| 44765.854166666664 | 33.42 |
| 44765.864583333336 | 33.4 |
| 44765.875 | 33.37 |
| 44765.885416666664 | 33.38 |
| 44765.895833333336 | 33.36 |
| 44765.90625 | 33.36 |
| 44765.916666666664 | 30.29 |
| 44765.927083333336 | 33.37 |
| 44765.9375 | 33.35 |
| 44765.947916666664 | 33.34 |
| 44765.958333333336 | 33.36 |
| 44765.96875 | 33.42 |
| 44765.979166666664 | 33.48 |
| 44765.989583333336 | 33.51 |
| 44766.0 | 33.52 |
| 44766.010416666664 | 33.47 |
| 44766.020833333336 | 33.5 |
| 44766.03125 | 33.53 |
| 44766.041666666664 | 33.59 |
| 44766.052083333336 | 33.68 |
| 44766.0625 | 33.63 |
| 44766.072916666664 | 33.53 |
| 44766.083333333336 | 33.48 |
| 44766.09375 | 33.42 |
| 44766.104166666664 | 33.36 |
| 44766.114583333336 | 33.29 |
| 44766.125 | 33.24 |
| 44766.135416666664 | 33.17 |
| 44766.145833333336 | 33.11 |
| 44766.15625 | 33.08 |
| 44766.166666666664 | 33.06 |
| 44766.177083333336 | 33.07 |
| 44766.1875 | 33.14 |
| 44766.197916666664 | 33.15 |
| 44766.208333333336 | 33.15 |
| 44766.21875 | 33.16 |
| 44766.229166666664 | 33.21 |
| 44766.239583333336 | 33.27 |
| 44766.25 | 33.33 |
| 44766.260416666664 | 33.36 |
| 44766.270833333336 | 33.41 |
| 44766.28125 | 33.43 |
| 44766.291666666664 | 33.45 |
| 44766.302083333336 | 33.47 |
| 44766.3125 | 33.48 |
| 44766.322916666664 | 33.49 |
| 44766.333333333336 | 33.51 |
| 44766.34375 | 33.51 |
| 44766.354166666664 | 33.53 |
| 44766.364583333336 | 33.55 |
| 44766.375 | 33.54 |
| 44766.385416666664 | 33.56 |
| 44766.395833333336 | 33.57 |
| 44766.40625 | 33.58 |
| 44766.416666666664 | 33.6 |
| 44766.427083333336 | 33.6 |
| 44766.4375 | 33.59 |
| 44766.447916666664 | 33.55 |
| 44766.458333333336 | 33.55 |
| 44766.46875 | 33.54 |
| 44766.479166666664 | 33.54 |
| 44766.489583333336 | 33.57 |
| 44766.5 | 33.57 |
| 44766.510416666664 | 33.56 |
| 44766.520833333336 | 33.56 |
| 44766.53125 | 33.54 |
| 44766.541666666664 | 33.52 |
| 44766.552083333336 | 33.45 |
| 44766.5625 | 33.39 |
| 44766.572916666664 | 33.38 |
| 44766.583333333336 | 33.34 |
| 44766.59375 | 33.29 |
| 44766.604166666664 | 33.25 |
| 44766.614583333336 | 33.17 |
| 44766.625 | 33.1 |
| 44766.635416666664 | 33.08 |
| 44766.645833333336 | 33.06 |
| 44766.65625 | 33.05 |
| 44766.666666666664 | 33.03 |
| 44766.677083333336 | 33.04 |
| 44766.6875 | 33.12 |
| 44766.697916666664 | 33.14 |
| 44766.708333333336 | 33.12 |
| 44766.71875 | 33.18 |
| 44766.729166666664 | 33.24 |
| 44766.739583333336 | 33.46 |
| 44766.75 | 33.56 |
| 44766.760416666664 | 33.59 |
| 44766.770833333336 | 33.63 |
| 44766.78125 | 33.68 |
| 44766.791666666664 | 33.73 |
| 44766.802083333336 | 33.81 |
| 44766.8125 | 33.87 |
| 44766.822916666664 | 33.9 |
| 44766.833333333336 | 33.92 |
| 44766.84375 | 33.92 |
| 44766.854166666664 | 33.91 |
| 44766.864583333336 | 33.88 |
| 44766.875 | 33.87 |
| 44766.885416666664 | 33.86 |
| 44766.895833333336 | 33.82 |
| 44766.90625 | 33.82 |
| 44766.916666666664 | 33.8 |
| 44766.927083333336 | 33.81 |
| 44766.9375 | 33.82 |
| 44766.947916666664 | 33.82 |
| 44766.958333333336 | 33.83 |
| 44766.96875 | 33.82 |
| 44766.979166666664 | 33.79 |
| 44766.989583333336 | 33.77 |
| 44767.0 | 33.83 |
| 44767.010416666664 | 33.79 |
| 44767.020833333336 | 33.85 |
| 44767.03125 | 33.93 |
| 44767.041666666664 | 33.96 |
| 44767.052083333336 | 34 |
| 44767.0625 | 33.93 |
| 44767.072916666664 | 33.94 |
| 44767.083333333336 | 33.96 |
| 44767.09375 | 33.91 |
| 44767.104166666664 | 33.86 |
| 44767.114583333336 | 33.78 |
| 44767.125 | 33.72 |
| 44767.135416666664 | 33.68 |
| 44767.145833333336 | 33.64 |
| 44767.15625 | 33.61 |
| 44767.166666666664 | 33.59 |
| 44767.177083333336 | 33.59 |
| 44767.1875 | 33.57 |
| 44767.197916666664 | 33.57 |
| 44767.208333333336 | 33.56 |
| 44767.21875 | 33.57 |
| 44767.229166666664 | 33.61 |
| 44767.239583333336 | 33.62 |
| 44767.25 | 33.61 |
| 44767.260416666664 | 33.63 |
| 44767.270833333336 | 33.65 |
| 44767.28125 | 33.71 |
| 44767.291666666664 | 33.74 |
| 44767.302083333336 | 33.78 |
| 44767.3125 | 33.86 |
| 44767.322916666664 | 33.94 |
| 44767.333333333336 | 34 |
| 44767.34375 | 34.08 |
| 44767.354166666664 | 34.2 |
| 44767.364583333336 | 34.35 |
| 44767.375 | 34.47 |
| 44767.385416666664 | 34.53 |
| 44767.395833333336 | 34.57 |
| 44767.40625 | 34.59 |
| 44767.416666666664 | 34.57 |
| 44767.427083333336 | 34.55 |
| 44767.4375 | 34.52 |
| 44767.447916666664 | 34.49 |
| 44767.458333333336 | 34.44 |
| 44767.46875 | 34.35 |
| 44767.479166666664 | 34.35 |
| 44767.489583333336 | 34.37 |
| 44767.5 | 34.46 |
| 44767.510416666664 | 34.47 |
| 44767.520833333336 | 34.48 |
| 44767.53125 | 34.49 |
| 44767.541666666664 | 34.47 |
| 44767.552083333336 | 34.48 |
| 44767.5625 | 34.47 |
| 44767.572916666664 | 34.46 |
| 44767.583333333336 | 34.35 |
| 44767.59375 | 34.13 |
| 44767.604166666664 | 33.98 |
| 44767.614583333336 | 33.9 |
| 44767.625 | 33.81 |
| 44767.635416666664 | 33.76 |
| 44767.645833333336 | 33.69 |
| 44767.65625 | 33.65 |
| 44767.666666666664 | 33.64 |
| 44767.677083333336 | 33.64 |
| 44767.6875 | 33.64 |
| 44767.697916666664 | 33.63 |
| 44767.708333333336 | 33.64 |
| 44767.71875 | 33.64 |
| 44767.729166666664 | 33.6 |
| 44767.739583333336 | 33.75 |
| 44767.75 | 33.77 |
| 44767.760416666664 | 33.82 |
| 44767.770833333336 | 34.01 |
| 44767.78125 | 34.29 |
| 44767.791666666664 | 34.46 |
| 44767.802083333336 | 34.54 |
| 44767.8125 | 34.67 |
| 44767.822916666664 | 34.7 |
| 44767.833333333336 | 34.76 |
| 44767.84375 | 34.87 |
| 44767.854166666664 | 34.85 |
| 44767.864583333336 | 34.84 |
| 44767.875 | 34.7 |
| 44767.885416666664 | 34.56 |
| 44767.895833333336 | 34.5 |
| 44767.90625 | 34.38 |
| 44767.916666666664 | 34.31 |
| 44767.927083333336 | 34.26 |
| 44767.9375 | 34.26 |
| 44767.947916666664 | 34.18 |
| 44767.958333333336 | 34.16 |
| 44767.96875 | 34.16 |
| 44767.979166666664 | 34.15 |
| 44767.989583333336 | 34.2 |
| 44768.0 | 34.25 |
| 44768.010416666664 | 34.11 |
| 44768.020833333336 | 34.15 |
| 44768.03125 | 34.24 |
| 44768.041666666664 | 34.25 |
| 44768.052083333336 | 34.28 |
| 44768.0625 | 34.49 |
| 44768.072916666664 | 34.45 |
| 44768.083333333336 | 34.59 |
| 44768.09375 | 34.65 |
| 44768.104166666664 | 34.59 |
| 44768.114583333336 | 34.59 |
| 44768.125 | 34.56 |
| 44768.135416666664 | 34.46 |
| 44768.145833333336 | 34.39 |
| 44768.15625 | 34.32 |
| 44768.166666666664 | 34.29 |
| 44768.177083333336 | 34.26 |
| 44768.1875 | 34.23 |
| 44768.197916666664 | 34.21 |
| 44768.208333333336 | 34.18 |
| 44768.21875 | 34.13 |
| 44768.229166666664 | 34.11 |
| 44768.239583333336 | 34.09 |
| 44768.25 | 34.09 |
| 44768.260416666664 | 34.16 |
| 44768.270833333336 | 34.19 |
| 44768.28125 | 34.16 |
| 44768.291666666664 | 34.18 |
| 44768.302083333336 | 34.22 |
| 44768.3125 | 34.25 |
| 44768.322916666664 | 34.33 |
| 44768.333333333336 | 34.36 |
| 44768.34375 | 34.38 |
| 44768.354166666664 | 34.4 |
| 44768.364583333336 | 34.45 |
| 44768.375 | 34.49 |
| 44768.385416666664 | 34.52 |
| 44768.395833333336 | 34.54 |
| 44768.40625 | 34.54 |
| 44768.416666666664 | 34.54 |
| 44768.427083333336 | 34.52 |
| 44768.4375 | 34.5 |
| 44768.447916666664 | 34.47 |
| 44768.458333333336 | 26.01 |
| 44768.46875 | 34.43 |
| 44768.479166666664 | 34.42 |
| 44768.489583333336 | 34.42 |
| 44768.5 | 34.29 |
| 44768.510416666664 | 34.3 |
| 44768.520833333336 | 34.29 |
| 44768.53125 | 34.13 |
| 44768.541666666664 | 34.3 |
| 44768.552083333336 | 34.19 |
| 44768.5625 | 34.26 |
| 44768.572916666664 | 34.35 |
| 44768.583333333336 | 34.4 |
| 44768.59375 | 34.41 |
| 44768.604166666664 | 34.43 |
| 44768.614583333336 | 34.47 |
| 44768.625 | 34.48 |
| 44768.635416666664 | 34.46 |
| 44768.645833333336 | 34.42 |
| 44768.65625 | 34.34 |
| 44768.666666666664 | 34.32 |
| 44768.677083333336 | 34.18 |
| 44768.6875 | 34.12 |
| 44768.697916666664 | 34.06 |
| 44768.708333333336 | 33.94 |
| 44768.71875 | 33.91 |
| 44768.729166666664 | 33.93 |
| 44768.739583333336 | 34.04 |
| 44768.75 | 34.1 |
| 44768.760416666664 | 34.09 |
| 44768.770833333336 | 34.1 |
| 44768.78125 | 34.19 |
| 44768.791666666664 | 34.24 |
| 44768.802083333336 | 34.3 |
| 44768.8125 | 34.32 |
| 44768.822916666664 | 34.29 |
| 44768.833333333336 | 34.32 |
| 44768.84375 | 34.34 |
| 44768.854166666664 | 34.34 |
| 44768.864583333336 | 34.31 |
| 44768.875 | 34.23 |
| 44768.885416666664 | 34.16 |
| 44768.895833333336 | 34.1 |
| 44768.90625 | 34.04 |
| 44768.916666666664 | 33.92 |
| 44768.927083333336 | 33.93 |
| 44768.9375 | 33.85 |
| 44768.947916666664 | 33.83 |
| 44768.958333333336 | 33.84 |
| 44768.96875 | 33.8 |
| 44768.979166666664 | 33.8 |
| 44768.989583333336 | 33.77 |
| 44769.0 | 33.79 |
| 44769.010416666664 | 33.8 |
| 44769.020833333336 | 33.81 |
| 44769.03125 | 31.02 |
| 44769.041666666664 | 33.81 |
| 44769.052083333336 | 33.86 |
| 44769.0625 | 33.86 |
| 44769.072916666664 | 33.79 |
| 44769.083333333336 | 33.77 |
| 44769.09375 | 33.76 |
| 44769.104166666664 | 33.8 |
| 44769.114583333336 | 33.79 |
| 44769.125 | 33.84 |
| 44769.135416666664 | 33.84 |
| 44769.145833333336 | 33.84 |
| 44769.15625 | 33.86 |
| 44769.166666666664 | 33.93 |
| 44769.177083333336 | 33.94 |
| 44769.1875 | 33.95 |
| 44769.197916666664 | 33.95 |
| 44769.208333333336 | 33.93 |
| 44769.21875 | 33.86 |
| 44769.229166666664 | 33.87 |
| 44769.239583333336 | 33.85 |
| 44769.25 | 33.83 |
| 44769.260416666664 | 33.82 |
| 44769.270833333336 | 33.85 |
| 44769.28125 | 33.85 |
| 44769.291666666664 | 33.83 |
| 44769.302083333336 | 33.84 |
| 44769.3125 | 33.83 |
| 44769.322916666664 | 33.85 |
| 44769.333333333336 | 33.86 |
| 44769.34375 | 33.86 |
| 44769.354166666664 | 33.87 |
| 44769.364583333336 | 33.88 |
| 44769.375 | 33.89 |
| 44769.385416666664 | 33.84 |
| 44769.395833333336 | 33.82 |
| 44769.40625 | 33.87 |
| 44769.416666666664 | 33.89 |
| 44769.427083333336 | 33.9 |
| 44769.4375 | 33.89 |
| 44769.447916666664 | 33.88 |
| 44769.458333333336 | 33.87 |
| 44769.46875 | 33.86 |
| 44769.479166666664 | 33.86 |
| 44769.489583333336 | 33.85 |
| 44769.5 | 33.83 |
| 44769.510416666664 | 33.82 |
| 44769.520833333336 | 33.81 |
| 44769.53125 | 33.84 |
| 44769.541666666664 | 33.84 |
| 44769.552083333336 | 33.8 |
| 44769.5625 | 33.79 |
| 44769.572916666664 | 33.82 |
| 44769.583333333336 | 33.82 |
| 44769.59375 | 33.85 |
| 44769.604166666664 | 33.84 |
| 44769.614583333336 | 33.79 |
| 44769.625 | 33.83 |
| 44769.635416666664 | 33.85 |
| 44769.645833333336 | 32.02 |
| 44769.65625 | 33.87 |
| 44769.666666666664 | 33.85 |
| 44769.677083333336 | 33.87 |
| 44769.6875 | 33.87 |
| 44769.697916666664 | 33.88 |
| 44769.708333333336 | 33.86 |
| 44769.71875 | 33.8 |
| 44769.729166666664 | 33.8 |
| 44769.739583333336 | 33.76 |
| 44769.75 | 33.77 |
| 44769.760416666664 | 33.7 |
| 44769.770833333336 | 33.67 |
| 44769.78125 | 33.71 |
| 44769.791666666664 | 33.73 |
| 44769.802083333336 | 33.7 |
| 44769.8125 | 33.72 |
| 44769.822916666664 | 33.75 |
| 44769.833333333336 | 33.79 |
| 44769.84375 | 33.8 |
| 44769.854166666664 | 33.8 |
| 44769.864583333336 | 33.81 |
| 44769.875 | 33.81 |
| 44769.885416666664 | 33.83 |
| 44769.895833333336 | 33.83 |
| 44769.90625 | 33.83 |
| 44769.916666666664 | 33.81 |
| 44769.927083333336 | 33.76 |
| 44769.9375 | 33.69 |
| 44769.947916666664 | 33.7 |
| 44769.958333333336 | 33.65 |
| 44769.96875 | 33.63 |
| 44769.979166666664 | 33.57 |
| 44769.989583333336 | 33.55 |
| 44770.0 | 33.53 |
| 44770.010416666664 | 33.52 |
| 44770.020833333336 | 33.51 |
| 44770.03125 | 33.53 |
| 44770.041666666664 | 33.53 |
| 44770.052083333336 | 33.54 |
| 44770.0625 | 33.59 |
| 44770.072916666664 | 33.63 |
| 44770.083333333336 | 33.58 |
| 44770.09375 | 33.58 |
| 44770.104166666664 | 33.62 |
| 44770.114583333336 | 33.66 |
| 44770.125 | 33.64 |
| 44770.135416666664 | 33.74 |
| 44770.145833333336 | 33.8 |
| 44770.15625 | 33.87 |
| 44770.166666666664 | 33.93 |
| 44770.177083333336 | 33.93 |
| 44770.1875 | 33.93 |
| 44770.197916666664 | 33.93 |
| 44770.208333333336 | 33.95 |
| 44770.21875 | 33.91 |
| 44770.229166666664 | 33.89 |
| 44770.239583333336 | 33.89 |
| 44770.25 | 33.83 |
| 44770.260416666664 | 33.81 |
| 44770.270833333336 | 33.76 |
| 44770.28125 | 33.71 |
| 44770.291666666664 | 33.69 |
| 44770.302083333336 | 33.69 |
| 44770.3125 | 33.7 |
| 44770.322916666664 | 33.72 |
| 44770.333333333336 | 33.73 |
| 44770.34375 | 33.73 |
| 44770.354166666664 | 33.74 |
| 44770.364583333336 | 33.76 |
| 44770.375 | 33.78 |
| 44770.385416666664 | 33.79 |
| 44770.395833333336 | 33.8 |
| 44770.40625 | 33.76 |
| 44770.416666666664 | 33.73 |
| 44770.427083333336 | 33.72 |
| 44770.4375 | 33.73 |
| 44770.447916666664 | 33.73 |
| 44770.458333333336 | 33.74 |
| 44770.46875 | 33.73 |
| 44770.479166666664 | 33.73 |
| 44770.489583333336 | 33.72 |
| 44770.5 | 33.72 |
| 44770.510416666664 | 33.72 |
| 44770.520833333336 | 33.71 |
| 44770.53125 | 33.71 |
| 44770.541666666664 | 33.7 |
| 44770.552083333336 | 33.71 |
| 44770.5625 | 33.69 |
| 44770.572916666664 | 33.68 |
| 44770.583333333336 | 33.66 |
| 44770.59375 | 33.69 |
| 44770.604166666664 | 33.71 |
| 44770.614583333336 | 33.73 |
| 44770.625 | 33.75 |
| 44770.635416666664 | 33.76 |
| 44770.645833333336 | 33.81 |
| 44770.65625 | 33.81 |
| 44770.666666666664 | 33.7 |
| 44770.677083333336 | 33.72 |
| 44770.6875 | 33.73 |
| 44770.697916666664 | 33.76 |
| 44770.708333333336 | 33.78 |
| 44770.71875 | 33.76 |
| 44770.729166666664 | 33.74 |
| 44770.739583333336 | 33.73 |
| 44770.75 | 33.71 |
| 44770.760416666664 | 33.68 |
| 44770.770833333336 | 33.63 |
| 44770.78125 | 33.63 |
| 44770.791666666664 | 33.64 |
| 44770.802083333336 | 33.67 |
| 44770.8125 | 33.63 |
| 44770.822916666664 | 33.64 |
| 44770.833333333336 | 33.63 |
| 44770.84375 | 33.63 |
| 44770.854166666664 | 33.67 |
| 44770.864583333336 | 33.67 |
| 44770.875 | 33.69 |
| 44770.885416666664 | 33.69 |
| 44770.895833333336 | 33.7 |
| 44770.90625 | 33.73 |
| 44770.916666666664 | 33.76 |
| 44770.927083333336 | 33.77 |
| 44770.9375 | 33.77 |
| 44770.947916666664 | 33.77 |
| 44770.958333333336 | 33.76 |
| 44770.96875 | 33.74 |
| 44770.979166666664 | 33.73 |
| 44770.989583333336 | 33.71 |
| 44771.0 | 33.65 |
| 44771.010416666664 | 33.6 |
| 44771.020833333336 | 33.58 |
| 44771.03125 | 33.58 |
| 44771.041666666664 | 33.58 |
| 44771.052083333336 | 33.59 |
| 44771.0625 | 33.6 |
| 44771.072916666664 | 33.61 |
| 44771.083333333336 | 33.62 |
| 44771.09375 | 33.64 |
| 44771.104166666664 | 33.63 |
| 44771.114583333336 | 33.64 |
| 44771.125 | 33.66 |
| 44771.135416666664 | 33.69 |
| 44771.145833333336 | 33.71 |
| 44771.15625 | 33.72 |
| 44771.166666666664 | 33.74 |
| 44771.177083333336 | 33.83 |
| 44771.1875 | 33.94 |
| 44771.197916666664 | 33.98 |
| 44771.208333333336 | 33.95 |
| 44771.21875 | 33.94 |
| 44771.229166666664 | 33.91 |
| 44771.239583333336 | 33.9 |
| 44771.25 | 33.85 |
| 44771.260416666664 | 33.84 |
| 44771.270833333336 | 33.79 |
| 44771.28125 | 33.77 |
| 44771.291666666664 | 33.74 |
| 44771.302083333336 | 33.71 |
| 44771.3125 | 33.68 |
| 44771.322916666664 | 33.66 |
| 44771.333333333336 | 33.65 |
| 44771.34375 | 33.67 |
| 44771.354166666664 | 33.71 |
| 44771.364583333336 | 33.69 |
| 44771.375 | 33.71 |
| 44771.385416666664 | 33.73 |
| 44771.395833333336 | 33.75 |
| 44771.40625 | 33.76 |
| 44771.416666666664 | 33.76 |
| 44771.427083333336 | 33.75 |
| 44771.4375 | 28.36 |
| 44771.447916666664 | 33.74 |
| 44771.458333333336 | 33.75 |
| 44771.46875 | 33.75 |
| 44771.479166666664 | 33.75 |
| 44771.489583333336 | 33.75 |
| 44771.5 | 33.74 |
| 44771.510416666664 | 33.73 |
| 44771.520833333336 | 33.73 |
| 44771.53125 | 33.72 |
| 44771.541666666664 | 33.72 |
| 44771.552083333336 | 33.7 |
| 44771.5625 | 33.69 |
| 44771.572916666664 | 33.69 |
| 44771.583333333336 | 33.67 |
| 44771.59375 | 33.65 |
| 44771.604166666664 | 33.7 |
| 44771.614583333336 | 33.73 |
| 44771.625 | 33.72 |
| 44771.635416666664 | 33.79 |
| 44771.645833333336 | 33.73 |
| 44771.65625 | 33.77 |
| 44771.666666666664 | 33.81 |
| 44771.677083333336 | 33.77 |
| 44771.6875 | 33.84 |
| 44771.697916666664 | 33.8 |
| 44771.708333333336 | 33.79 |
| 44771.71875 | 33.76 |
| 44771.729166666664 | 33.8 |
| 44771.739583333336 | 33.73 |
| 44771.75 | 33.71 |
| 44771.760416666664 | 33.67 |
| 44771.770833333336 | 33.64 |
| 44771.78125 | 33.65 |
| 44771.791666666664 | 33.67 |
| 44771.802083333336 | 33.57 |
| 44771.8125 | 33.59 |
| 44771.822916666664 | 33.58 |
| 44771.833333333336 | 33.6 |
| 44771.84375 | 33.62 |
| 44771.854166666664 | 33.59 |
| 44771.864583333336 | 33.57 |
| 44771.875 | 33.49 |
| 44771.885416666664 | 33.38 |
| 44771.895833333336 | 33.43 |
| 44771.90625 | 33.47 |
| 44771.916666666664 | 33.49 |
| 44771.927083333336 | 33.48 |
| 44771.9375 | 33.46 |
| 44771.947916666664 | 33.44 |
| 44771.958333333336 | 33.44 |
| 44771.96875 | 33.43 |
| 44771.979166666664 | 33.42 |
| 44771.989583333336 | 33.43 |
| 44772.0 | 33.42 |
| 44772.010416666664 | 33.43 |
| 44772.020833333336 | 33.42 |
| 44772.03125 | 33.39 |
| 44772.041666666664 | 33.38 |
| 44772.052083333336 | 33.39 |
| 44772.0625 | 33.4 |
| 44772.072916666664 | 33.43 |
| 44772.083333333336 | 33.46 |
| 44772.09375 | 33.5 |
| 44772.104166666664 | 33.51 |
| 44772.114583333336 | 33.55 |
| 44772.125 | 33.5 |
| 44772.135416666664 | 33.5 |
| 44772.145833333336 | 33.51 |
| 44772.15625 | 33.5 |
| 44772.166666666664 | 33.42 |
| 44772.177083333336 | 33.35 |
| 44772.1875 | 33.35 |
| 44772.197916666664 | 33.34 |
| 44772.208333333336 | 33.33 |
| 44772.21875 | 33.24 |
| 44772.229166666664 | 33.18 |
| 44772.239583333336 | 33.09 |
| 44772.25 | 33.09 |
| 44772.260416666664 | 33.09 |
| 44772.270833333336 | 33.04 |
| 44772.28125 | 33.01 |
| 44772.291666666664 | 33.01 |
| 44772.302083333336 | 32.95 |
| 44772.3125 | 32.94 |
| 44772.322916666664 | 32.88 |
| 44772.333333333336 | 32.85 |
| 44772.34375 | 32.82 |
| 44772.354166666664 | 32.83 |
| 44772.364583333336 | 32.83 |
| 44772.375 | 32.85 |
| 44772.385416666664 | 32.88 |
| 44772.395833333336 | 32.9 |
| 44772.40625 | 32.94 |
| 44772.416666666664 | 32.99 |
| 44772.427083333336 | 33.05 |
| 44772.4375 | 33.11 |
| 44772.447916666664 | 33.16 |
| 44772.458333333336 | 33.21 |
| 44772.46875 | 33.24 |
| 44772.479166666664 | 33.28 |
| 44772.489583333336 | 33.3 |
| 44772.5 | 33.31 |
| 44772.510416666664 | 33.32 |
| 44772.520833333336 | 33.33 |
| 44772.53125 | 33.35 |
| 44772.541666666664 | 33.36 |
| 44772.552083333336 | 33.38 |
| 44772.5625 | 33.39 |
| 44772.572916666664 | 33.41 |
| 44772.583333333336 | 33.43 |
| 44772.59375 | 33.47 |
| 44772.604166666664 | 33.49 |
| 44772.614583333336 | 33.51 |
| 44772.625 | 33.5 |
| 44772.635416666664 | 33.53 |
| 44772.645833333336 | 33.44 |
| 44772.65625 | 33.5 |
| 44772.666666666664 | 33.5 |
| 44772.677083333336 | 33.5 |
| 44772.6875 | 33.48 |
| 44772.697916666664 | 33.46 |
| 44772.708333333336 | 33.44 |
| 44772.71875 | 33.42 |
| 44772.729166666664 | 33.43 |
| 44772.739583333336 | 33.29 |
| 44772.75 | 33.27 |
| 44772.760416666664 | 33.26 |
| 44772.770833333336 | 33.17 |
| 44772.78125 | 33.14 |
| 44772.791666666664 | 33.14 |
| 44772.802083333336 | 33.03 |
| 44772.8125 | 33 |
| 44772.822916666664 | 32.94 |
| 44772.833333333336 | 32.85 |
| 44772.84375 | 32.83 |
| 44772.854166666664 | 32.83 |
| 44772.864583333336 | 32.86 |
| 44772.875 | 32.9 |
| 44772.885416666664 | 32.94 |
| 44772.895833333336 | 32.94 |
| 44772.90625 | 33 |
| 44772.916666666664 | 33.06 |
| 44772.927083333336 | 33.13 |
| 44772.9375 | 33.21 |
| 44772.947916666664 | 33.3 |
| 44772.958333333336 | 33.34 |
| 44772.96875 | 33.4 |
| 44772.979166666664 | 33.43 |
| 44772.989583333336 | 33.46 |
| 44773.0 | 33.49 |
| 44773.010416666664 | 33.51 |
| 44773.020833333336 | 33.53 |
| 44773.03125 | 33.56 |
| 44773.041666666664 | 33.58 |
| 44773.052083333336 | 33.58 |
| 44773.0625 | 33.57 |
| 44773.072916666664 | 33.56 |
| 44773.083333333336 | 33.55 |
| 44773.09375 | 33.55 |
| 44773.104166666664 | 33.55 |
| 44773.114583333336 | 33.54 |
| 44773.125 | 33.55 |
| 44773.135416666664 | 33.57 |
| 44773.145833333336 | 33.55 |
| 44773.15625 | 33.55 |
| 44773.166666666664 | 33.55 |
| 44773.177083333336 | 33.57 |
| 44773.1875 | 33.59 |
| 44773.197916666664 | 33.62 |
| 44773.208333333336 | 33.65 |
| 44773.21875 | 33.65 |
| 44773.229166666664 | 33.64 |
| 44773.239583333336 | 33.66 |
| 44773.25 | 33.63 |
| 44773.260416666664 | 33.62 |
| 44773.270833333336 | 33.54 |
| 44773.28125 | 33.52 |
| 44773.291666666664 | 33.43 |
| 44773.302083333336 | 33.33 |
| 44773.3125 | 33.27 |
| 44773.322916666664 | 33.17 |
| 44773.333333333336 | 33.08 |
| 44773.34375 | 33.04 |
| 44773.354166666664 | 33.01 |
| 44773.364583333336 | 33.03 |
| 44773.375 | 32.97 |
| 44773.385416666664 | 32.96 |
| 44773.395833333336 | 33.01 |
| 44773.40625 | 33.03 |
| 44773.416666666664 | 33.03 |
| 44773.427083333336 | 33.04 |
| 44773.4375 | 33.09 |
| 44773.447916666664 | 33.16 |
| 44773.458333333336 | 33.23 |
| 44773.46875 | 33.23 |
| 44773.479166666664 | 33.32 |
| 44773.489583333336 | 33.36 |
| 44773.5 | 33.38 |
| 44773.510416666664 | 33.41 |
| 44773.520833333336 | 33.43 |
| 44773.53125 | 33.46 |
| 44773.541666666664 | 33.48 |
| 44773.552083333336 | 33.5 |
| 44773.5625 | 33.52 |
| 44773.572916666664 | 33.51 |
| 44773.583333333336 | 33.51 |
| 44773.59375 | 33.51 |
| 44773.604166666664 | 33.51 |
| 44773.614583333336 | 33.5 |
| 44773.625 | 33.49 |
| 44773.635416666664 | 33.49 |
| 44773.645833333336 | 33.45 |
| 44773.65625 | 33.44 |
| 44773.666666666664 | 33.49 |
| 44773.677083333336 | 33.48 |
| 44773.6875 | 33.53 |
| 44773.697916666664 | 33.53 |
| 44773.708333333336 | 33.52 |
| 44773.71875 | 33.53 |
| 44773.729166666664 | 33.55 |
| 44773.739583333336 | 33.52 |
| 44773.75 | 33.53 |
| 44773.760416666664 | 33.48 |
| 44773.770833333336 | 33.44 |
| 44773.78125 | 33.42 |
| 44773.791666666664 | 33.39 |
| 44773.802083333336 | 33.3 |
| 44773.8125 | 33.23 |
| 44773.822916666664 | 33.14 |
| 44773.833333333336 | 33.07 |
| 44773.84375 | 33.03 |
| 44773.854166666664 | 32.98 |
| 44773.864583333336 | 32.95 |
| 44773.875 | 32.95 |
| 44773.885416666664 | 32.94 |
| 44773.895833333336 | 32.97 |
| 44773.90625 | 33 |
| 44773.916666666664 | 33.01 |
| 44773.927083333336 | 33.04 |
| 44773.9375 | 33.12 |
| 44773.947916666664 | 33.2 |
| 44773.958333333336 | 33.31 |
| 44773.96875 | 33.34 |
| 44773.979166666664 | 33.39 |
| 44773.989583333336 | 33.45 |
| 44774.0 | 33.48 |
| 44774.010416666664 | 33.52 |
| 44774.020833333336 | 33.55 |
| 44774.03125 | 33.57 |
| 44774.041666666664 | 33.58 |
| 44774.052083333336 | 33.58 |
| 44774.0625 | 33.59 |
| 44774.072916666664 | 33.6 |
| 44774.083333333336 | 33.59 |
| 44774.09375 | 33.59 |
| 44774.104166666664 | 33.59 |
| 44774.114583333336 | 33.58 |
| 44774.125 | 33.56 |
| 44774.135416666664 | 33.56 |
| 44774.145833333336 | 33.56 |
| 44774.15625 | 33.56 |